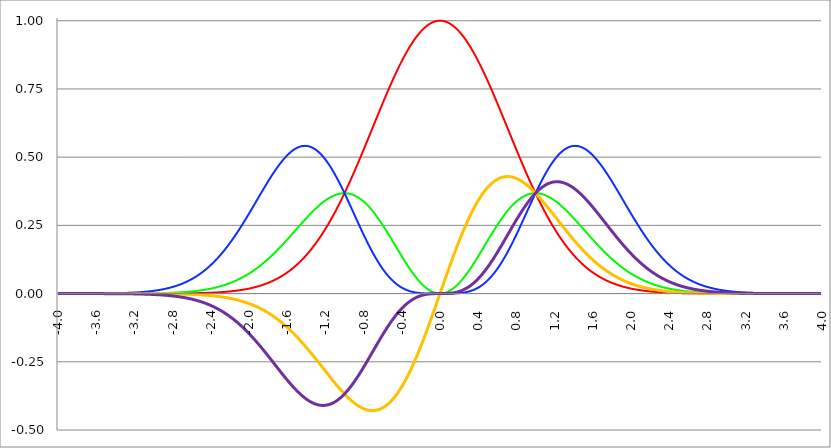
| Category | Series 1 | Series 0 | Series 2 | Series 3 | Series 4 |
|---|---|---|---|---|---|
| -4.0 | 0 | 0 | 0 | 0 | 0 |
| -3.996 | 0 | 0 | 0 | 0 | 0 |
| -3.992 | 0 | 0 | 0 | 0 | 0 |
| -3.988 | 0 | 0 | 0 | 0 | 0 |
| -3.984 | 0 | 0 | 0 | 0 | 0 |
| -3.98 | 0 | 0 | 0 | 0 | 0 |
| -3.976 | 0 | 0 | 0 | 0 | 0 |
| -3.972 | 0 | 0 | 0 | 0 | 0 |
| -3.968 | 0 | 0 | 0 | 0 | 0 |
| -3.964 | 0 | 0 | 0 | 0 | 0 |
| -3.96 | 0 | 0 | 0 | 0 | 0 |
| -3.956 | 0 | 0 | 0 | 0 | 0 |
| -3.952 | 0 | 0 | 0 | 0 | 0 |
| -3.948 | 0 | 0 | 0 | 0 | 0 |
| -3.944 | 0 | 0 | 0 | 0 | 0 |
| -3.94 | 0 | 0 | 0 | 0 | 0 |
| -3.936 | 0 | 0 | 0 | 0 | 0 |
| -3.932 | 0 | 0 | 0 | 0 | 0 |
| -3.928 | 0 | 0 | 0 | 0 | 0 |
| -3.924 | 0 | 0 | 0 | 0 | 0 |
| -3.92 | 0 | 0 | 0 | 0 | 0 |
| -3.916 | 0 | 0 | 0 | 0 | 0 |
| -3.912 | 0 | 0 | 0 | 0 | 0 |
| -3.908 | 0 | 0 | 0 | 0 | 0 |
| -3.904 | 0 | 0 | 0 | 0 | 0 |
| -3.9 | 0 | 0 | 0 | 0 | 0 |
| -3.896 | 0 | 0 | 0 | 0 | 0 |
| -3.892 | 0 | 0 | 0 | 0 | 0 |
| -3.888 | 0 | 0 | 0 | 0 | 0 |
| -3.884 | 0 | 0 | 0 | 0 | 0 |
| -3.88 | 0 | 0 | 0 | 0 | 0 |
| -3.876 | 0 | 0 | 0 | 0 | 0 |
| -3.872 | 0 | 0 | 0 | 0 | 0 |
| -3.868 | 0 | 0 | 0 | 0 | 0 |
| -3.864 | 0 | 0 | 0 | 0 | 0 |
| -3.86 | 0 | 0 | 0 | 0 | 0 |
| -3.856 | 0 | 0 | 0 | 0 | 0 |
| -3.852 | 0 | 0 | 0 | 0 | 0 |
| -3.848 | 0 | 0 | 0 | 0 | 0 |
| -3.844 | 0 | 0 | 0 | 0 | 0 |
| -3.84 | 0 | 0 | 0 | 0 | 0 |
| -3.836 | 0 | 0 | 0 | 0 | 0 |
| -3.832 | 0 | 0 | 0 | 0 | 0 |
| -3.828 | 0 | 0 | 0 | 0 | 0 |
| -3.824 | 0 | 0 | 0 | 0 | 0 |
| -3.82 | 0 | 0 | 0 | 0 | 0 |
| -3.816 | 0 | 0 | 0 | 0 | 0 |
| -3.812 | 0 | 0 | 0 | 0 | 0 |
| -3.808 | 0 | 0 | 0 | 0 | 0 |
| -3.804 | 0 | 0 | 0 | 0 | 0 |
| -3.8 | 0 | 0 | 0 | 0 | 0 |
| -3.796 | 0 | 0 | 0 | 0 | 0 |
| -3.792 | 0 | 0 | 0 | 0 | 0 |
| -3.788 | 0 | 0 | 0 | 0 | 0 |
| -3.784 | 0 | 0 | 0 | 0 | 0 |
| -3.78 | 0 | 0 | 0 | 0 | 0 |
| -3.776 | 0 | 0 | 0 | 0 | 0 |
| -3.772 | 0 | 0 | 0 | 0 | 0 |
| -3.768 | 0 | 0 | 0 | 0 | 0 |
| -3.764 | 0 | 0 | 0 | 0 | 0 |
| -3.76 | 0 | 0 | 0 | 0 | 0 |
| -3.756 | 0 | 0 | 0 | 0 | 0 |
| -3.752 | 0 | 0 | 0 | 0 | 0 |
| -3.748 | 0 | 0 | 0 | 0 | 0 |
| -3.744 | 0 | 0 | 0 | 0 | 0 |
| -3.74 | 0 | 0 | 0 | 0 | 0 |
| -3.736 | 0 | 0 | 0 | 0 | 0 |
| -3.732 | 0 | 0 | 0 | 0 | 0 |
| -3.728 | 0 | 0 | 0 | 0 | 0 |
| -3.724 | 0 | 0 | 0 | 0 | 0 |
| -3.72 | 0 | 0 | 0 | 0 | 0 |
| -3.716 | 0 | 0 | 0 | 0 | 0 |
| -3.712 | 0 | 0 | 0 | 0 | 0 |
| -3.708 | 0 | 0 | 0 | 0 | 0 |
| -3.704 | 0 | 0 | 0 | 0 | 0 |
| -3.7 | 0 | 0 | 0 | 0 | 0 |
| -3.696 | 0 | 0 | 0 | 0 | 0 |
| -3.692 | 0 | 0 | 0 | 0 | 0 |
| -3.688 | 0 | 0 | 0 | 0 | 0 |
| -3.684 | 0 | 0 | 0 | 0 | 0 |
| -3.68 | 0 | 0 | 0 | 0 | 0 |
| -3.676 | 0 | 0 | 0 | 0 | 0 |
| -3.672 | 0 | 0 | 0 | 0 | 0 |
| -3.668 | 0 | 0 | 0 | 0 | 0 |
| -3.664 | 0 | 0 | 0 | 0 | 0 |
| -3.66 | 0 | 0 | 0 | 0 | 0 |
| -3.656 | 0 | 0 | 0 | 0 | 0 |
| -3.652 | 0 | 0 | 0 | 0 | 0 |
| -3.648 | 0 | 0 | 0 | 0 | 0 |
| -3.644 | 0 | 0 | 0 | 0 | 0 |
| -3.64 | 0 | 0 | 0 | 0 | 0 |
| -3.636 | 0 | 0 | 0 | 0 | 0 |
| -3.632 | 0 | 0 | 0 | 0 | 0 |
| -3.628 | 0 | 0 | 0 | 0 | 0 |
| -3.624 | 0 | 0 | 0 | 0 | 0 |
| -3.62 | 0 | 0 | 0 | 0 | 0 |
| -3.616 | 0 | 0 | 0 | 0 | 0 |
| -3.612 | 0 | 0 | 0 | 0 | 0 |
| -3.608 | 0 | 0 | 0 | 0 | 0 |
| -3.604 | 0 | 0 | 0 | 0 | 0 |
| -3.6 | 0 | 0 | 0 | 0 | 0 |
| -3.596 | 0 | 0 | 0 | 0 | 0 |
| -3.592 | 0 | 0 | 0 | 0 | 0 |
| -3.588 | 0 | 0 | 0 | 0 | 0 |
| -3.584 | 0 | 0 | 0 | 0 | 0 |
| -3.58 | 0 | 0 | 0 | 0 | 0 |
| -3.576 | 0 | 0 | 0 | 0 | 0 |
| -3.572 | 0 | 0 | 0 | 0 | 0 |
| -3.568 | 0 | 0 | 0 | 0 | 0 |
| -3.564 | 0 | 0 | 0 | 0 | 0 |
| -3.56 | 0 | 0 | 0.001 | 0 | 0 |
| -3.556 | 0 | 0 | 0.001 | 0 | 0 |
| -3.552 | 0 | 0 | 0.001 | 0 | 0 |
| -3.548 | 0 | 0 | 0.001 | 0 | 0 |
| -3.544 | 0 | 0 | 0.001 | 0 | 0 |
| -3.54 | 0 | 0 | 0.001 | 0 | 0 |
| -3.536 | 0 | 0 | 0.001 | 0 | 0 |
| -3.532 | 0 | 0 | 0.001 | 0 | 0 |
| -3.528 | 0 | 0 | 0.001 | 0 | 0 |
| -3.524 | 0 | 0 | 0.001 | 0 | 0 |
| -3.52 | 0 | 0 | 0.001 | 0 | 0 |
| -3.516 | 0 | 0 | 0.001 | 0 | 0 |
| -3.512 | 0 | 0 | 0.001 | 0 | 0 |
| -3.508 | 0 | 0 | 0.001 | 0 | 0 |
| -3.504 | 0 | 0 | 0.001 | 0 | 0 |
| -3.5 | 0 | 0 | 0.001 | 0 | 0 |
| -3.496 | 0 | 0 | 0.001 | 0 | 0 |
| -3.492 | 0 | 0 | 0.001 | 0 | 0 |
| -3.488 | 0 | 0 | 0.001 | 0 | 0 |
| -3.484 | 0 | 0 | 0.001 | 0 | 0 |
| -3.48 | 0 | 0 | 0.001 | 0 | 0 |
| -3.476 | 0 | 0 | 0.001 | 0 | 0 |
| -3.472 | 0 | 0 | 0.001 | 0 | 0 |
| -3.467999999999999 | 0 | 0 | 0.001 | 0 | 0 |
| -3.463999999999999 | 0 | 0 | 0.001 | 0 | 0 |
| -3.459999999999999 | 0 | 0 | 0.001 | 0 | 0 |
| -3.455999999999999 | 0 | 0 | 0.001 | 0 | 0 |
| -3.451999999999999 | 0 | 0 | 0.001 | 0 | 0 |
| -3.447999999999999 | 0 | 0 | 0.001 | 0 | 0 |
| -3.443999999999999 | 0 | 0 | 0.001 | 0 | 0 |
| -3.439999999999999 | 0 | 0 | 0.001 | 0 | 0 |
| -3.435999999999999 | 0 | 0 | 0.001 | 0 | 0 |
| -3.431999999999999 | 0 | 0 | 0.001 | 0 | 0 |
| -3.427999999999999 | 0 | 0 | 0.001 | 0 | 0 |
| -3.423999999999999 | 0 | 0 | 0.001 | 0 | 0 |
| -3.419999999999999 | 0 | 0 | 0.001 | 0 | 0 |
| -3.415999999999999 | 0 | 0 | 0.001 | 0 | 0 |
| -3.411999999999999 | 0 | 0 | 0.001 | 0 | 0 |
| -3.407999999999999 | 0 | 0 | 0.001 | 0 | 0 |
| -3.403999999999999 | 0 | 0 | 0.001 | 0 | 0 |
| -3.399999999999999 | 0 | 0 | 0.001 | 0 | 0 |
| -3.395999999999999 | 0 | 0 | 0.001 | 0 | 0 |
| -3.391999999999999 | 0 | 0 | 0.001 | 0 | 0 |
| -3.387999999999999 | 0 | 0 | 0.001 | 0 | 0 |
| -3.383999999999999 | 0 | 0 | 0.001 | 0 | 0 |
| -3.379999999999999 | 0 | 0 | 0.001 | 0 | 0 |
| -3.375999999999999 | 0 | 0 | 0.001 | 0 | 0 |
| -3.371999999999999 | 0 | 0 | 0.001 | 0 | 0 |
| -3.367999999999999 | 0 | 0 | 0.002 | 0 | 0 |
| -3.363999999999999 | 0 | 0 | 0.002 | 0 | 0 |
| -3.359999999999999 | 0 | 0 | 0.002 | 0 | 0 |
| -3.355999999999999 | 0 | 0 | 0.002 | 0 | 0 |
| -3.351999999999999 | 0 | 0 | 0.002 | 0 | 0 |
| -3.347999999999999 | 0 | 0 | 0.002 | 0 | -0.001 |
| -3.343999999999999 | 0 | 0 | 0.002 | 0 | -0.001 |
| -3.339999999999999 | 0 | 0 | 0.002 | 0 | -0.001 |
| -3.335999999999999 | 0 | 0 | 0.002 | 0 | -0.001 |
| -3.331999999999999 | 0 | 0 | 0.002 | 0 | -0.001 |
| -3.327999999999999 | 0 | 0 | 0.002 | 0 | -0.001 |
| -3.323999999999999 | 0 | 0 | 0.002 | 0 | -0.001 |
| -3.319999999999999 | 0 | 0 | 0.002 | 0 | -0.001 |
| -3.315999999999999 | 0 | 0 | 0.002 | 0 | -0.001 |
| -3.311999999999999 | 0 | 0 | 0.002 | 0 | -0.001 |
| -3.307999999999999 | 0 | 0 | 0.002 | 0 | -0.001 |
| -3.303999999999999 | 0 | 0 | 0.002 | 0 | -0.001 |
| -3.299999999999999 | 0 | 0 | 0.002 | 0 | -0.001 |
| -3.295999999999999 | 0 | 0 | 0.002 | 0 | -0.001 |
| -3.291999999999999 | 0 | 0 | 0.002 | 0 | -0.001 |
| -3.288 | 0 | 0 | 0.002 | 0 | -0.001 |
| -3.284 | 0 | 0 | 0.002 | 0 | -0.001 |
| -3.279999999999999 | 0 | 0 | 0.002 | 0 | -0.001 |
| -3.275999999999999 | 0 | 0 | 0.003 | 0 | -0.001 |
| -3.271999999999999 | 0 | 0 | 0.003 | 0 | -0.001 |
| -3.268 | 0 | 0 | 0.003 | 0 | -0.001 |
| -3.264 | 0 | 0 | 0.003 | 0 | -0.001 |
| -3.259999999999999 | 0 | 0 | 0.003 | 0 | -0.001 |
| -3.255999999999999 | 0 | 0 | 0.003 | 0 | -0.001 |
| -3.251999999999999 | 0 | 0 | 0.003 | 0 | -0.001 |
| -3.248 | 0 | 0 | 0.003 | 0 | -0.001 |
| -3.244 | 0 | 0 | 0.003 | 0 | -0.001 |
| -3.239999999999999 | 0 | 0 | 0.003 | 0 | -0.001 |
| -3.235999999999999 | 0 | 0 | 0.003 | 0 | -0.001 |
| -3.231999999999999 | 0 | 0 | 0.003 | 0 | -0.001 |
| -3.228 | 0 | 0 | 0.003 | 0 | -0.001 |
| -3.224 | 0 | 0 | 0.003 | 0 | -0.001 |
| -3.219999999999999 | 0 | 0 | 0.003 | 0 | -0.001 |
| -3.215999999999999 | 0 | 0 | 0.003 | 0 | -0.001 |
| -3.211999999999999 | 0 | 0 | 0.004 | 0 | -0.001 |
| -3.208 | 0 | 0 | 0.004 | 0 | -0.001 |
| -3.204 | 0 | 0 | 0.004 | 0 | -0.001 |
| -3.199999999999999 | 0 | 0 | 0.004 | 0 | -0.001 |
| -3.195999999999999 | 0 | 0 | 0.004 | 0 | -0.001 |
| -3.191999999999999 | 0 | 0 | 0.004 | 0 | -0.001 |
| -3.188 | 0 | 0 | 0.004 | 0 | -0.001 |
| -3.184 | 0 | 0 | 0.004 | 0 | -0.001 |
| -3.179999999999999 | 0 | 0 | 0.004 | 0 | -0.001 |
| -3.175999999999999 | 0 | 0 | 0.004 | 0 | -0.001 |
| -3.171999999999999 | 0 | 0 | 0.004 | 0 | -0.001 |
| -3.168 | 0 | 0 | 0.004 | 0 | -0.001 |
| -3.164 | 0 | 0 | 0.005 | 0 | -0.001 |
| -3.159999999999999 | 0 | 0 | 0.005 | 0 | -0.001 |
| -3.155999999999999 | 0 | 0 | 0.005 | 0 | -0.001 |
| -3.151999999999999 | 0 | 0 | 0.005 | 0 | -0.002 |
| -3.148 | 0 | 0 | 0.005 | 0 | -0.002 |
| -3.144 | 0 | 0.001 | 0.005 | 0 | -0.002 |
| -3.139999999999999 | 0 | 0.001 | 0.005 | 0 | -0.002 |
| -3.135999999999999 | 0 | 0.001 | 0.005 | 0 | -0.002 |
| -3.131999999999999 | 0 | 0.001 | 0.005 | 0 | -0.002 |
| -3.128 | 0 | 0.001 | 0.005 | 0 | -0.002 |
| -3.124 | 0 | 0.001 | 0.006 | 0 | -0.002 |
| -3.119999999999999 | 0 | 0.001 | 0.006 | 0 | -0.002 |
| -3.115999999999999 | 0 | 0.001 | 0.006 | 0 | -0.002 |
| -3.111999999999999 | 0 | 0.001 | 0.006 | 0 | -0.002 |
| -3.108 | 0 | 0.001 | 0.006 | 0 | -0.002 |
| -3.104 | 0 | 0.001 | 0.006 | 0 | -0.002 |
| -3.099999999999999 | 0 | 0.001 | 0.006 | 0 | -0.002 |
| -3.095999999999999 | 0 | 0.001 | 0.006 | 0 | -0.002 |
| -3.091999999999999 | 0 | 0.001 | 0.006 | 0 | -0.002 |
| -3.088 | 0 | 0.001 | 0.007 | 0 | -0.002 |
| -3.084 | 0 | 0.001 | 0.007 | 0 | -0.002 |
| -3.079999999999999 | 0 | 0.001 | 0.007 | 0 | -0.002 |
| -3.075999999999999 | 0 | 0.001 | 0.007 | 0 | -0.002 |
| -3.071999999999999 | 0 | 0.001 | 0.007 | 0 | -0.002 |
| -3.068 | 0 | 0.001 | 0.007 | 0 | -0.002 |
| -3.064 | 0 | 0.001 | 0.007 | 0 | -0.002 |
| -3.059999999999999 | 0 | 0.001 | 0.008 | 0 | -0.002 |
| -3.055999999999999 | 0 | 0.001 | 0.008 | 0 | -0.003 |
| -3.051999999999999 | 0 | 0.001 | 0.008 | 0 | -0.003 |
| -3.048 | 0 | 0.001 | 0.008 | 0 | -0.003 |
| -3.044 | 0 | 0.001 | 0.008 | 0 | -0.003 |
| -3.039999999999999 | 0 | 0.001 | 0.008 | 0 | -0.003 |
| -3.035999999999999 | 0 | 0.001 | 0.008 | 0 | -0.003 |
| -3.031999999999999 | 0 | 0.001 | 0.009 | 0 | -0.003 |
| -3.028 | 0 | 0.001 | 0.009 | 0 | -0.003 |
| -3.024 | 0 | 0.001 | 0.009 | 0 | -0.003 |
| -3.019999999999999 | 0 | 0.001 | 0.009 | 0 | -0.003 |
| -3.015999999999999 | 0 | 0.001 | 0.009 | 0 | -0.003 |
| -3.011999999999999 | 0 | 0.001 | 0.009 | 0 | -0.003 |
| -3.008 | 0 | 0.001 | 0.01 | 0 | -0.003 |
| -3.004 | 0 | 0.001 | 0.01 | 0 | -0.003 |
| -2.999999999999999 | 0 | 0.001 | 0.01 | 0 | -0.003 |
| -2.995999999999999 | 0 | 0.001 | 0.01 | 0 | -0.003 |
| -2.991999999999999 | 0 | 0.001 | 0.01 | 0 | -0.003 |
| -2.988 | 0 | 0.001 | 0.011 | 0 | -0.004 |
| -2.984 | 0 | 0.001 | 0.011 | 0 | -0.004 |
| -2.979999999999999 | 0 | 0.001 | 0.011 | 0 | -0.004 |
| -2.975999999999999 | 0 | 0.001 | 0.011 | 0 | -0.004 |
| -2.971999999999999 | 0 | 0.001 | 0.011 | 0 | -0.004 |
| -2.968 | 0 | 0.001 | 0.012 | 0 | -0.004 |
| -2.964 | 0 | 0.001 | 0.012 | 0 | -0.004 |
| -2.959999999999999 | 0 | 0.001 | 0.012 | 0 | -0.004 |
| -2.955999999999999 | 0 | 0.001 | 0.012 | 0 | -0.004 |
| -2.951999999999999 | 0 | 0.001 | 0.012 | 0 | -0.004 |
| -2.948 | 0 | 0.001 | 0.013 | 0 | -0.004 |
| -2.944 | 0 | 0.001 | 0.013 | -0.001 | -0.004 |
| -2.939999999999999 | 0 | 0.002 | 0.013 | -0.001 | -0.004 |
| -2.935999999999999 | 0 | 0.002 | 0.013 | -0.001 | -0.005 |
| -2.931999999999999 | 0 | 0.002 | 0.014 | -0.001 | -0.005 |
| -2.928 | 0 | 0.002 | 0.014 | -0.001 | -0.005 |
| -2.924 | 0 | 0.002 | 0.014 | -0.001 | -0.005 |
| -2.919999999999999 | 0 | 0.002 | 0.014 | -0.001 | -0.005 |
| -2.915999999999999 | 0 | 0.002 | 0.015 | -0.001 | -0.005 |
| -2.911999999999999 | 0 | 0.002 | 0.015 | -0.001 | -0.005 |
| -2.908 | 0 | 0.002 | 0.015 | -0.001 | -0.005 |
| -2.904 | 0 | 0.002 | 0.015 | -0.001 | -0.005 |
| -2.899999999999999 | 0 | 0.002 | 0.016 | -0.001 | -0.005 |
| -2.895999999999999 | 0 | 0.002 | 0.016 | -0.001 | -0.006 |
| -2.891999999999999 | 0 | 0.002 | 0.016 | -0.001 | -0.006 |
| -2.887999999999999 | 0 | 0.002 | 0.017 | -0.001 | -0.006 |
| -2.883999999999999 | 0 | 0.002 | 0.017 | -0.001 | -0.006 |
| -2.879999999999999 | 0 | 0.002 | 0.017 | -0.001 | -0.006 |
| -2.875999999999999 | 0 | 0.002 | 0.017 | -0.001 | -0.006 |
| -2.871999999999999 | 0 | 0.002 | 0.018 | -0.001 | -0.006 |
| -2.867999999999999 | 0 | 0.002 | 0.018 | -0.001 | -0.006 |
| -2.863999999999999 | 0 | 0.002 | 0.018 | -0.001 | -0.006 |
| -2.859999999999999 | 0 | 0.002 | 0.019 | -0.001 | -0.007 |
| -2.855999999999999 | 0 | 0.002 | 0.019 | -0.001 | -0.007 |
| -2.851999999999999 | 0 | 0.002 | 0.019 | -0.001 | -0.007 |
| -2.847999999999999 | 0 | 0.002 | 0.02 | -0.001 | -0.007 |
| -2.843999999999999 | 0 | 0.002 | 0.02 | -0.001 | -0.007 |
| -2.839999999999999 | 0 | 0.003 | 0.02 | -0.001 | -0.007 |
| -2.835999999999999 | 0 | 0.003 | 0.021 | -0.001 | -0.007 |
| -2.831999999999999 | 0 | 0.003 | 0.021 | -0.001 | -0.007 |
| -2.827999999999999 | 0 | 0.003 | 0.022 | -0.001 | -0.008 |
| -2.823999999999999 | 0 | 0.003 | 0.022 | -0.001 | -0.008 |
| -2.819999999999999 | 0 | 0.003 | 0.022 | -0.001 | -0.008 |
| -2.815999999999999 | 0 | 0.003 | 0.023 | -0.001 | -0.008 |
| -2.811999999999999 | 0 | 0.003 | 0.023 | -0.001 | -0.008 |
| -2.807999999999999 | 0 | 0.003 | 0.023 | -0.001 | -0.008 |
| -2.803999999999999 | 0 | 0.003 | 0.024 | -0.001 | -0.008 |
| -2.799999999999999 | 0 | 0.003 | 0.024 | -0.001 | -0.009 |
| -2.795999999999999 | 0 | 0.003 | 0.025 | -0.001 | -0.009 |
| -2.791999999999999 | 0 | 0.003 | 0.025 | -0.001 | -0.009 |
| -2.787999999999999 | 0 | 0.003 | 0.025 | -0.001 | -0.009 |
| -2.783999999999999 | 0 | 0.003 | 0.026 | -0.001 | -0.009 |
| -2.779999999999999 | 0 | 0.003 | 0.026 | -0.001 | -0.009 |
| -2.775999999999999 | 0 | 0.003 | 0.027 | -0.001 | -0.01 |
| -2.771999999999999 | 0 | 0.004 | 0.027 | -0.001 | -0.01 |
| -2.767999999999999 | 0 | 0.004 | 0.028 | -0.001 | -0.01 |
| -2.763999999999999 | 0 | 0.004 | 0.028 | -0.001 | -0.01 |
| -2.759999999999999 | 0 | 0.004 | 0.029 | -0.001 | -0.01 |
| -2.755999999999999 | 0.001 | 0.004 | 0.029 | -0.001 | -0.011 |
| -2.751999999999999 | 0.001 | 0.004 | 0.029 | -0.001 | -0.011 |
| -2.747999999999999 | 0.001 | 0.004 | 0.03 | -0.001 | -0.011 |
| -2.743999999999999 | 0.001 | 0.004 | 0.03 | -0.001 | -0.011 |
| -2.739999999999999 | 0.001 | 0.004 | 0.031 | -0.002 | -0.011 |
| -2.735999999999999 | 0.001 | 0.004 | 0.031 | -0.002 | -0.011 |
| -2.731999999999999 | 0.001 | 0.004 | 0.032 | -0.002 | -0.012 |
| -2.727999999999999 | 0.001 | 0.004 | 0.032 | -0.002 | -0.012 |
| -2.723999999999999 | 0.001 | 0.004 | 0.033 | -0.002 | -0.012 |
| -2.719999999999999 | 0.001 | 0.005 | 0.034 | -0.002 | -0.012 |
| -2.715999999999999 | 0.001 | 0.005 | 0.034 | -0.002 | -0.013 |
| -2.711999999999999 | 0.001 | 0.005 | 0.035 | -0.002 | -0.013 |
| -2.707999999999999 | 0.001 | 0.005 | 0.035 | -0.002 | -0.013 |
| -2.703999999999999 | 0.001 | 0.005 | 0.036 | -0.002 | -0.013 |
| -2.699999999999999 | 0.001 | 0.005 | 0.036 | -0.002 | -0.013 |
| -2.695999999999999 | 0.001 | 0.005 | 0.037 | -0.002 | -0.014 |
| -2.691999999999999 | 0.001 | 0.005 | 0.037 | -0.002 | -0.014 |
| -2.687999999999999 | 0.001 | 0.005 | 0.038 | -0.002 | -0.014 |
| -2.683999999999999 | 0.001 | 0.005 | 0.039 | -0.002 | -0.014 |
| -2.679999999999999 | 0.001 | 0.005 | 0.039 | -0.002 | -0.015 |
| -2.675999999999999 | 0.001 | 0.006 | 0.04 | -0.002 | -0.015 |
| -2.671999999999999 | 0.001 | 0.006 | 0.04 | -0.002 | -0.015 |
| -2.667999999999999 | 0.001 | 0.006 | 0.041 | -0.002 | -0.015 |
| -2.663999999999999 | 0.001 | 0.006 | 0.042 | -0.002 | -0.016 |
| -2.659999999999999 | 0.001 | 0.006 | 0.042 | -0.002 | -0.016 |
| -2.655999999999999 | 0.001 | 0.006 | 0.043 | -0.002 | -0.016 |
| -2.651999999999999 | 0.001 | 0.006 | 0.044 | -0.002 | -0.016 |
| -2.647999999999999 | 0.001 | 0.006 | 0.044 | -0.002 | -0.017 |
| -2.643999999999999 | 0.001 | 0.006 | 0.045 | -0.002 | -0.017 |
| -2.639999999999999 | 0.001 | 0.007 | 0.046 | -0.002 | -0.017 |
| -2.635999999999999 | 0.001 | 0.007 | 0.046 | -0.003 | -0.018 |
| -2.631999999999999 | 0.001 | 0.007 | 0.047 | -0.003 | -0.018 |
| -2.627999999999999 | 0.001 | 0.007 | 0.048 | -0.003 | -0.018 |
| -2.623999999999999 | 0.001 | 0.007 | 0.048 | -0.003 | -0.018 |
| -2.619999999999999 | 0.001 | 0.007 | 0.049 | -0.003 | -0.019 |
| -2.615999999999999 | 0.001 | 0.007 | 0.05 | -0.003 | -0.019 |
| -2.611999999999999 | 0.001 | 0.007 | 0.051 | -0.003 | -0.019 |
| -2.607999999999999 | 0.001 | 0.008 | 0.051 | -0.003 | -0.02 |
| -2.603999999999999 | 0.001 | 0.008 | 0.052 | -0.003 | -0.02 |
| -2.599999999999999 | 0.001 | 0.008 | 0.053 | -0.003 | -0.02 |
| -2.595999999999999 | 0.001 | 0.008 | 0.054 | -0.003 | -0.021 |
| -2.591999999999999 | 0.001 | 0.008 | 0.055 | -0.003 | -0.021 |
| -2.587999999999999 | 0.001 | 0.008 | 0.055 | -0.003 | -0.021 |
| -2.583999999999999 | 0.001 | 0.008 | 0.056 | -0.003 | -0.022 |
| -2.579999999999999 | 0.001 | 0.009 | 0.057 | -0.003 | -0.022 |
| -2.575999999999999 | 0.001 | 0.009 | 0.058 | -0.003 | -0.022 |
| -2.571999999999999 | 0.001 | 0.009 | 0.059 | -0.003 | -0.023 |
| -2.567999999999999 | 0.001 | 0.009 | 0.059 | -0.004 | -0.023 |
| -2.563999999999999 | 0.001 | 0.009 | 0.06 | -0.004 | -0.024 |
| -2.559999999999999 | 0.001 | 0.009 | 0.061 | -0.004 | -0.024 |
| -2.555999999999999 | 0.001 | 0.01 | 0.062 | -0.004 | -0.024 |
| -2.551999999999999 | 0.001 | 0.01 | 0.063 | -0.004 | -0.025 |
| -2.547999999999999 | 0.002 | 0.01 | 0.064 | -0.004 | -0.025 |
| -2.543999999999999 | 0.002 | 0.01 | 0.065 | -0.004 | -0.025 |
| -2.539999999999999 | 0.002 | 0.01 | 0.066 | -0.004 | -0.026 |
| -2.535999999999999 | 0.002 | 0.01 | 0.067 | -0.004 | -0.026 |
| -2.531999999999999 | 0.002 | 0.011 | 0.068 | -0.004 | -0.027 |
| -2.527999999999999 | 0.002 | 0.011 | 0.068 | -0.004 | -0.027 |
| -2.523999999999999 | 0.002 | 0.011 | 0.069 | -0.004 | -0.028 |
| -2.519999999999999 | 0.002 | 0.011 | 0.07 | -0.004 | -0.028 |
| -2.515999999999999 | 0.002 | 0.011 | 0.071 | -0.004 | -0.028 |
| -2.511999999999999 | 0.002 | 0.011 | 0.072 | -0.005 | -0.029 |
| -2.507999999999999 | 0.002 | 0.012 | 0.073 | -0.005 | -0.029 |
| -2.503999999999999 | 0.002 | 0.012 | 0.074 | -0.005 | -0.03 |
| -2.499999999999999 | 0.002 | 0.012 | 0.075 | -0.005 | -0.03 |
| -2.495999999999999 | 0.002 | 0.012 | 0.076 | -0.005 | -0.031 |
| -2.491999999999999 | 0.002 | 0.012 | 0.077 | -0.005 | -0.031 |
| -2.487999999999999 | 0.002 | 0.013 | 0.079 | -0.005 | -0.032 |
| -2.483999999999999 | 0.002 | 0.013 | 0.08 | -0.005 | -0.032 |
| -2.479999999999999 | 0.002 | 0.013 | 0.081 | -0.005 | -0.033 |
| -2.475999999999999 | 0.002 | 0.013 | 0.082 | -0.005 | -0.033 |
| -2.471999999999999 | 0.002 | 0.014 | 0.083 | -0.005 | -0.034 |
| -2.467999999999999 | 0.002 | 0.014 | 0.084 | -0.006 | -0.034 |
| -2.463999999999999 | 0.002 | 0.014 | 0.085 | -0.006 | -0.035 |
| -2.459999999999999 | 0.002 | 0.014 | 0.086 | -0.006 | -0.035 |
| -2.455999999999999 | 0.002 | 0.014 | 0.087 | -0.006 | -0.036 |
| -2.451999999999999 | 0.002 | 0.015 | 0.089 | -0.006 | -0.036 |
| -2.447999999999999 | 0.002 | 0.015 | 0.09 | -0.006 | -0.037 |
| -2.443999999999999 | 0.003 | 0.015 | 0.091 | -0.006 | -0.037 |
| -2.439999999999999 | 0.003 | 0.015 | 0.092 | -0.006 | -0.038 |
| -2.435999999999999 | 0.003 | 0.016 | 0.093 | -0.006 | -0.038 |
| -2.431999999999999 | 0.003 | 0.016 | 0.094 | -0.007 | -0.039 |
| -2.427999999999999 | 0.003 | 0.016 | 0.096 | -0.007 | -0.039 |
| -2.423999999999999 | 0.003 | 0.016 | 0.097 | -0.007 | -0.04 |
| -2.419999999999999 | 0.003 | 0.017 | 0.098 | -0.007 | -0.041 |
| -2.415999999999999 | 0.003 | 0.017 | 0.099 | -0.007 | -0.041 |
| -2.411999999999999 | 0.003 | 0.017 | 0.101 | -0.007 | -0.042 |
| -2.407999999999999 | 0.003 | 0.018 | 0.102 | -0.007 | -0.042 |
| -2.403999999999999 | 0.003 | 0.018 | 0.103 | -0.007 | -0.043 |
| -2.399999999999999 | 0.003 | 0.018 | 0.105 | -0.008 | -0.044 |
| -2.395999999999999 | 0.003 | 0.018 | 0.106 | -0.008 | -0.044 |
| -2.391999999999999 | 0.003 | 0.019 | 0.107 | -0.008 | -0.045 |
| -2.387999999999999 | 0.003 | 0.019 | 0.109 | -0.008 | -0.045 |
| -2.383999999999999 | 0.003 | 0.019 | 0.11 | -0.008 | -0.046 |
| -2.379999999999999 | 0.003 | 0.02 | 0.111 | -0.008 | -0.047 |
| -2.375999999999999 | 0.004 | 0.02 | 0.113 | -0.008 | -0.047 |
| -2.371999999999999 | 0.004 | 0.02 | 0.114 | -0.009 | -0.048 |
| -2.367999999999998 | 0.004 | 0.021 | 0.115 | -0.009 | -0.049 |
| -2.363999999999998 | 0.004 | 0.021 | 0.117 | -0.009 | -0.049 |
| -2.359999999999998 | 0.004 | 0.021 | 0.118 | -0.009 | -0.05 |
| -2.355999999999998 | 0.004 | 0.022 | 0.12 | -0.009 | -0.051 |
| -2.351999999999998 | 0.004 | 0.022 | 0.121 | -0.009 | -0.052 |
| -2.347999999999998 | 0.004 | 0.022 | 0.123 | -0.009 | -0.052 |
| -2.343999999999998 | 0.004 | 0.023 | 0.124 | -0.01 | -0.053 |
| -2.339999999999998 | 0.004 | 0.023 | 0.126 | -0.01 | -0.054 |
| -2.335999999999998 | 0.004 | 0.023 | 0.127 | -0.01 | -0.054 |
| -2.331999999999998 | 0.004 | 0.024 | 0.129 | -0.01 | -0.055 |
| -2.327999999999998 | 0.004 | 0.024 | 0.13 | -0.01 | -0.056 |
| -2.323999999999998 | 0.005 | 0.024 | 0.132 | -0.01 | -0.057 |
| -2.319999999999998 | 0.005 | 0.025 | 0.133 | -0.011 | -0.057 |
| -2.315999999999998 | 0.005 | 0.025 | 0.135 | -0.011 | -0.058 |
| -2.311999999999998 | 0.005 | 0.025 | 0.136 | -0.011 | -0.059 |
| -2.307999999999998 | 0.005 | 0.026 | 0.138 | -0.011 | -0.06 |
| -2.303999999999998 | 0.005 | 0.026 | 0.139 | -0.011 | -0.061 |
| -2.299999999999998 | 0.005 | 0.027 | 0.141 | -0.012 | -0.061 |
| -2.295999999999998 | 0.005 | 0.027 | 0.143 | -0.012 | -0.062 |
| -2.291999999999998 | 0.005 | 0.027 | 0.144 | -0.012 | -0.063 |
| -2.287999999999998 | 0.005 | 0.028 | 0.146 | -0.012 | -0.064 |
| -2.283999999999998 | 0.005 | 0.028 | 0.148 | -0.012 | -0.065 |
| -2.279999999999998 | 0.006 | 0.029 | 0.149 | -0.013 | -0.065 |
| -2.275999999999998 | 0.006 | 0.029 | 0.151 | -0.013 | -0.066 |
| -2.271999999999998 | 0.006 | 0.03 | 0.153 | -0.013 | -0.067 |
| -2.267999999999998 | 0.006 | 0.03 | 0.154 | -0.013 | -0.068 |
| -2.263999999999998 | 0.006 | 0.03 | 0.156 | -0.013 | -0.069 |
| -2.259999999999998 | 0.006 | 0.031 | 0.158 | -0.014 | -0.07 |
| -2.255999999999998 | 0.006 | 0.031 | 0.16 | -0.014 | -0.071 |
| -2.251999999999998 | 0.006 | 0.032 | 0.161 | -0.014 | -0.072 |
| -2.247999999999998 | 0.006 | 0.032 | 0.163 | -0.014 | -0.073 |
| -2.243999999999998 | 0.007 | 0.033 | 0.165 | -0.015 | -0.073 |
| -2.239999999999998 | 0.007 | 0.033 | 0.167 | -0.015 | -0.074 |
| -2.235999999999998 | 0.007 | 0.034 | 0.168 | -0.015 | -0.075 |
| -2.231999999999998 | 0.007 | 0.034 | 0.17 | -0.015 | -0.076 |
| -2.227999999999998 | 0.007 | 0.035 | 0.172 | -0.016 | -0.077 |
| -2.223999999999998 | 0.007 | 0.035 | 0.174 | -0.016 | -0.078 |
| -2.219999999999998 | 0.007 | 0.036 | 0.176 | -0.016 | -0.079 |
| -2.215999999999998 | 0.007 | 0.036 | 0.178 | -0.016 | -0.08 |
| -2.211999999999998 | 0.007 | 0.037 | 0.18 | -0.017 | -0.081 |
| -2.207999999999998 | 0.008 | 0.037 | 0.181 | -0.017 | -0.082 |
| -2.203999999999998 | 0.008 | 0.038 | 0.183 | -0.017 | -0.083 |
| -2.199999999999998 | 0.008 | 0.038 | 0.185 | -0.017 | -0.084 |
| -2.195999999999998 | 0.008 | 0.039 | 0.187 | -0.018 | -0.085 |
| -2.191999999999998 | 0.008 | 0.039 | 0.189 | -0.018 | -0.086 |
| -2.187999999999998 | 0.008 | 0.04 | 0.191 | -0.018 | -0.087 |
| -2.183999999999998 | 0.008 | 0.04 | 0.193 | -0.019 | -0.088 |
| -2.179999999999998 | 0.009 | 0.041 | 0.195 | -0.019 | -0.089 |
| -2.175999999999998 | 0.009 | 0.042 | 0.197 | -0.019 | -0.09 |
| -2.171999999999998 | 0.009 | 0.042 | 0.199 | -0.019 | -0.092 |
| -2.167999999999998 | 0.009 | 0.043 | 0.201 | -0.02 | -0.093 |
| -2.163999999999998 | 0.009 | 0.043 | 0.203 | -0.02 | -0.094 |
| -2.159999999999998 | 0.009 | 0.044 | 0.205 | -0.02 | -0.095 |
| -2.155999999999998 | 0.01 | 0.045 | 0.207 | -0.021 | -0.096 |
| -2.151999999999998 | 0.01 | 0.045 | 0.209 | -0.021 | -0.097 |
| -2.147999999999998 | 0.01 | 0.046 | 0.211 | -0.021 | -0.098 |
| -2.143999999999998 | 0.01 | 0.046 | 0.213 | -0.022 | -0.099 |
| -2.139999999999998 | 0.01 | 0.047 | 0.215 | -0.022 | -0.101 |
| -2.135999999999998 | 0.01 | 0.048 | 0.217 | -0.022 | -0.102 |
| -2.131999999999998 | 0.011 | 0.048 | 0.219 | -0.023 | -0.103 |
| -2.127999999999998 | 0.011 | 0.049 | 0.221 | -0.023 | -0.104 |
| -2.123999999999998 | 0.011 | 0.05 | 0.224 | -0.023 | -0.105 |
| -2.119999999999998 | 0.011 | 0.05 | 0.226 | -0.024 | -0.106 |
| -2.115999999999998 | 0.011 | 0.051 | 0.228 | -0.024 | -0.108 |
| -2.111999999999998 | 0.012 | 0.052 | 0.23 | -0.024 | -0.109 |
| -2.107999999999998 | 0.012 | 0.052 | 0.232 | -0.025 | -0.11 |
| -2.103999999999998 | 0.012 | 0.053 | 0.234 | -0.025 | -0.111 |
| -2.099999999999998 | 0.012 | 0.054 | 0.236 | -0.026 | -0.113 |
| -2.095999999999998 | 0.012 | 0.054 | 0.239 | -0.026 | -0.114 |
| -2.091999999999998 | 0.013 | 0.055 | 0.241 | -0.026 | -0.115 |
| -2.087999999999998 | 0.013 | 0.056 | 0.243 | -0.027 | -0.116 |
| -2.083999999999998 | 0.013 | 0.056 | 0.245 | -0.027 | -0.118 |
| -2.079999999999998 | 0.013 | 0.057 | 0.247 | -0.027 | -0.119 |
| -2.075999999999998 | 0.013 | 0.058 | 0.25 | -0.028 | -0.12 |
| -2.071999999999998 | 0.014 | 0.059 | 0.252 | -0.028 | -0.122 |
| -2.067999999999998 | 0.014 | 0.059 | 0.254 | -0.029 | -0.123 |
| -2.063999999999998 | 0.014 | 0.06 | 0.256 | -0.029 | -0.124 |
| -2.059999999999998 | 0.014 | 0.061 | 0.259 | -0.03 | -0.125 |
| -2.055999999999998 | 0.015 | 0.062 | 0.261 | -0.03 | -0.127 |
| -2.051999999999998 | 0.015 | 0.062 | 0.263 | -0.03 | -0.128 |
| -2.047999999999998 | 0.015 | 0.063 | 0.265 | -0.031 | -0.13 |
| -2.043999999999998 | 0.015 | 0.064 | 0.268 | -0.031 | -0.131 |
| -2.039999999999998 | 0.016 | 0.065 | 0.27 | -0.032 | -0.132 |
| -2.035999999999998 | 0.016 | 0.066 | 0.272 | -0.032 | -0.134 |
| -2.031999999999998 | 0.016 | 0.066 | 0.274 | -0.033 | -0.135 |
| -2.027999999999998 | 0.016 | 0.067 | 0.277 | -0.033 | -0.136 |
| -2.023999999999998 | 0.017 | 0.068 | 0.279 | -0.034 | -0.138 |
| -2.019999999999998 | 0.017 | 0.069 | 0.281 | -0.034 | -0.139 |
| -2.015999999999998 | 0.017 | 0.07 | 0.284 | -0.035 | -0.141 |
| -2.011999999999998 | 0.017 | 0.071 | 0.286 | -0.035 | -0.142 |
| -2.007999999999998 | 0.018 | 0.072 | 0.288 | -0.036 | -0.144 |
| -2.003999999999998 | 0.018 | 0.072 | 0.291 | -0.036 | -0.145 |
| -1.999999999999998 | 0.018 | 0.073 | 0.293 | -0.037 | -0.147 |
| -1.995999999999998 | 0.019 | 0.074 | 0.295 | -0.037 | -0.148 |
| -1.991999999999998 | 0.019 | 0.075 | 0.298 | -0.038 | -0.149 |
| -1.987999999999998 | 0.019 | 0.076 | 0.3 | -0.038 | -0.151 |
| -1.983999999999998 | 0.02 | 0.077 | 0.302 | -0.039 | -0.152 |
| -1.979999999999998 | 0.02 | 0.078 | 0.305 | -0.039 | -0.154 |
| -1.975999999999998 | 0.02 | 0.079 | 0.307 | -0.04 | -0.155 |
| -1.971999999999998 | 0.02 | 0.08 | 0.31 | -0.04 | -0.157 |
| -1.967999999999998 | 0.021 | 0.081 | 0.312 | -0.041 | -0.159 |
| -1.963999999999998 | 0.021 | 0.081 | 0.314 | -0.041 | -0.16 |
| -1.959999999999998 | 0.021 | 0.082 | 0.317 | -0.042 | -0.162 |
| -1.955999999999998 | 0.022 | 0.083 | 0.319 | -0.043 | -0.163 |
| -1.951999999999998 | 0.022 | 0.084 | 0.321 | -0.043 | -0.165 |
| -1.947999999999998 | 0.022 | 0.085 | 0.324 | -0.044 | -0.166 |
| -1.943999999999998 | 0.023 | 0.086 | 0.326 | -0.044 | -0.168 |
| -1.939999999999998 | 0.023 | 0.087 | 0.329 | -0.045 | -0.169 |
| -1.935999999999998 | 0.024 | 0.088 | 0.331 | -0.046 | -0.171 |
| -1.931999999999998 | 0.024 | 0.089 | 0.333 | -0.046 | -0.173 |
| -1.927999999999998 | 0.024 | 0.09 | 0.336 | -0.047 | -0.174 |
| -1.923999999999998 | 0.025 | 0.091 | 0.338 | -0.047 | -0.176 |
| -1.919999999999998 | 0.025 | 0.092 | 0.341 | -0.048 | -0.177 |
| -1.915999999999998 | 0.025 | 0.093 | 0.343 | -0.049 | -0.179 |
| -1.911999999999998 | 0.026 | 0.094 | 0.345 | -0.049 | -0.181 |
| -1.907999999999998 | 0.026 | 0.096 | 0.348 | -0.05 | -0.182 |
| -1.903999999999998 | 0.027 | 0.097 | 0.35 | -0.051 | -0.184 |
| -1.899999999999998 | 0.027 | 0.098 | 0.353 | -0.051 | -0.186 |
| -1.895999999999998 | 0.027 | 0.099 | 0.355 | -0.052 | -0.187 |
| -1.891999999999998 | 0.028 | 0.1 | 0.357 | -0.053 | -0.189 |
| -1.887999999999998 | 0.028 | 0.101 | 0.36 | -0.053 | -0.191 |
| -1.883999999999998 | 0.029 | 0.102 | 0.362 | -0.054 | -0.192 |
| -1.879999999999998 | 0.029 | 0.103 | 0.364 | -0.055 | -0.194 |
| -1.875999999999998 | 0.03 | 0.104 | 0.367 | -0.056 | -0.196 |
| -1.871999999999998 | 0.03 | 0.105 | 0.369 | -0.056 | -0.197 |
| -1.867999999999998 | 0.031 | 0.106 | 0.372 | -0.057 | -0.199 |
| -1.863999999999998 | 0.031 | 0.108 | 0.374 | -0.058 | -0.201 |
| -1.859999999999998 | 0.031 | 0.109 | 0.376 | -0.058 | -0.202 |
| -1.855999999999998 | 0.032 | 0.11 | 0.379 | -0.059 | -0.204 |
| -1.851999999999998 | 0.032 | 0.111 | 0.381 | -0.06 | -0.206 |
| -1.847999999999998 | 0.033 | 0.112 | 0.383 | -0.061 | -0.207 |
| -1.843999999999998 | 0.033 | 0.113 | 0.386 | -0.062 | -0.209 |
| -1.839999999999998 | 0.034 | 0.115 | 0.388 | -0.062 | -0.211 |
| -1.835999999999998 | 0.034 | 0.116 | 0.39 | -0.063 | -0.213 |
| -1.831999999999998 | 0.035 | 0.117 | 0.393 | -0.064 | -0.214 |
| -1.827999999999998 | 0.035 | 0.118 | 0.395 | -0.065 | -0.216 |
| -1.823999999999998 | 0.036 | 0.119 | 0.397 | -0.065 | -0.218 |
| -1.819999999999998 | 0.036 | 0.121 | 0.4 | -0.066 | -0.22 |
| -1.815999999999998 | 0.037 | 0.122 | 0.402 | -0.067 | -0.221 |
| -1.811999999999998 | 0.038 | 0.123 | 0.404 | -0.068 | -0.223 |
| -1.807999999999998 | 0.038 | 0.124 | 0.407 | -0.069 | -0.225 |
| -1.803999999999998 | 0.039 | 0.126 | 0.409 | -0.07 | -0.227 |
| -1.799999999999998 | 0.039 | 0.127 | 0.411 | -0.07 | -0.228 |
| -1.795999999999998 | 0.04 | 0.128 | 0.413 | -0.071 | -0.23 |
| -1.791999999999998 | 0.04 | 0.129 | 0.416 | -0.072 | -0.232 |
| -1.787999999999998 | 0.041 | 0.131 | 0.418 | -0.073 | -0.234 |
| -1.783999999999998 | 0.041 | 0.132 | 0.42 | -0.074 | -0.235 |
| -1.779999999999998 | 0.042 | 0.133 | 0.422 | -0.075 | -0.237 |
| -1.775999999999998 | 0.043 | 0.135 | 0.425 | -0.076 | -0.239 |
| -1.771999999999998 | 0.043 | 0.136 | 0.427 | -0.077 | -0.241 |
| -1.767999999999998 | 0.044 | 0.137 | 0.429 | -0.078 | -0.243 |
| -1.763999999999998 | 0.045 | 0.139 | 0.431 | -0.079 | -0.244 |
| -1.759999999999998 | 0.045 | 0.14 | 0.433 | -0.079 | -0.246 |
| -1.755999999999998 | 0.046 | 0.141 | 0.435 | -0.08 | -0.248 |
| -1.751999999999998 | 0.046 | 0.143 | 0.438 | -0.081 | -0.25 |
| -1.747999999999998 | 0.047 | 0.144 | 0.44 | -0.082 | -0.252 |
| -1.743999999999998 | 0.048 | 0.145 | 0.442 | -0.083 | -0.253 |
| -1.739999999999998 | 0.048 | 0.147 | 0.444 | -0.084 | -0.255 |
| -1.735999999999998 | 0.049 | 0.148 | 0.446 | -0.085 | -0.257 |
| -1.731999999999998 | 0.05 | 0.149 | 0.448 | -0.086 | -0.259 |
| -1.727999999999998 | 0.05 | 0.151 | 0.45 | -0.087 | -0.261 |
| -1.723999999999998 | 0.051 | 0.152 | 0.452 | -0.088 | -0.262 |
| -1.719999999999998 | 0.052 | 0.154 | 0.454 | -0.089 | -0.264 |
| -1.715999999999998 | 0.053 | 0.155 | 0.456 | -0.09 | -0.266 |
| -1.711999999999998 | 0.053 | 0.156 | 0.458 | -0.091 | -0.268 |
| -1.707999999999998 | 0.054 | 0.158 | 0.46 | -0.092 | -0.269 |
| -1.703999999999998 | 0.055 | 0.159 | 0.462 | -0.093 | -0.271 |
| -1.699999999999998 | 0.056 | 0.161 | 0.464 | -0.094 | -0.273 |
| -1.695999999999998 | 0.056 | 0.162 | 0.466 | -0.096 | -0.275 |
| -1.691999999999998 | 0.057 | 0.163 | 0.468 | -0.097 | -0.277 |
| -1.687999999999998 | 0.058 | 0.165 | 0.47 | -0.098 | -0.278 |
| -1.683999999999998 | 0.059 | 0.166 | 0.472 | -0.099 | -0.28 |
| -1.679999999999998 | 0.059 | 0.168 | 0.474 | -0.1 | -0.282 |
| -1.675999999999998 | 0.06 | 0.169 | 0.476 | -0.101 | -0.284 |
| -1.671999999999998 | 0.061 | 0.171 | 0.477 | -0.102 | -0.285 |
| -1.667999999999998 | 0.062 | 0.172 | 0.479 | -0.103 | -0.287 |
| -1.663999999999998 | 0.063 | 0.174 | 0.481 | -0.104 | -0.289 |
| -1.659999999999998 | 0.064 | 0.175 | 0.483 | -0.106 | -0.291 |
| -1.655999999999998 | 0.064 | 0.177 | 0.484 | -0.107 | -0.293 |
| -1.651999999999998 | 0.065 | 0.178 | 0.486 | -0.108 | -0.294 |
| -1.647999999999998 | 0.066 | 0.18 | 0.488 | -0.109 | -0.296 |
| -1.643999999999998 | 0.067 | 0.181 | 0.49 | -0.11 | -0.298 |
| -1.639999999999998 | 0.068 | 0.183 | 0.491 | -0.111 | -0.3 |
| -1.635999999999998 | 0.069 | 0.184 | 0.493 | -0.113 | -0.301 |
| -1.631999999999998 | 0.07 | 0.186 | 0.495 | -0.114 | -0.303 |
| -1.627999999999998 | 0.071 | 0.187 | 0.496 | -0.115 | -0.305 |
| -1.623999999999998 | 0.072 | 0.189 | 0.498 | -0.116 | -0.306 |
| -1.619999999999998 | 0.072 | 0.19 | 0.499 | -0.117 | -0.308 |
| -1.615999999999998 | 0.073 | 0.192 | 0.501 | -0.119 | -0.31 |
| -1.611999999999998 | 0.074 | 0.193 | 0.502 | -0.12 | -0.312 |
| -1.607999999999998 | 0.075 | 0.195 | 0.504 | -0.121 | -0.313 |
| -1.603999999999998 | 0.076 | 0.196 | 0.505 | -0.122 | -0.315 |
| -1.599999999999998 | 0.077 | 0.198 | 0.507 | -0.124 | -0.317 |
| -1.595999999999998 | 0.078 | 0.199 | 0.508 | -0.125 | -0.318 |
| -1.591999999999998 | 0.079 | 0.201 | 0.509 | -0.126 | -0.32 |
| -1.587999999999998 | 0.08 | 0.203 | 0.511 | -0.128 | -0.322 |
| -1.583999999999998 | 0.081 | 0.204 | 0.512 | -0.129 | -0.323 |
| -1.579999999999998 | 0.082 | 0.206 | 0.513 | -0.13 | -0.325 |
| -1.575999999999998 | 0.083 | 0.207 | 0.515 | -0.131 | -0.327 |
| -1.571999999999998 | 0.084 | 0.209 | 0.516 | -0.133 | -0.328 |
| -1.567999999999998 | 0.086 | 0.21 | 0.517 | -0.134 | -0.33 |
| -1.563999999999998 | 0.087 | 0.212 | 0.518 | -0.135 | -0.331 |
| -1.559999999999998 | 0.088 | 0.213 | 0.52 | -0.137 | -0.333 |
| -1.555999999999998 | 0.089 | 0.215 | 0.521 | -0.138 | -0.335 |
| -1.551999999999998 | 0.09 | 0.217 | 0.522 | -0.14 | -0.336 |
| -1.547999999999998 | 0.091 | 0.218 | 0.523 | -0.141 | -0.338 |
| -1.543999999999998 | 0.092 | 0.22 | 0.524 | -0.142 | -0.339 |
| -1.539999999999998 | 0.093 | 0.221 | 0.525 | -0.144 | -0.341 |
| -1.535999999999998 | 0.094 | 0.223 | 0.526 | -0.145 | -0.342 |
| -1.531999999999998 | 0.096 | 0.225 | 0.527 | -0.147 | -0.344 |
| -1.527999999999998 | 0.097 | 0.226 | 0.528 | -0.148 | -0.345 |
| -1.523999999999998 | 0.098 | 0.228 | 0.529 | -0.149 | -0.347 |
| -1.519999999999998 | 0.099 | 0.229 | 0.53 | -0.151 | -0.348 |
| -1.515999999999998 | 0.1 | 0.231 | 0.53 | -0.152 | -0.35 |
| -1.511999999999998 | 0.102 | 0.232 | 0.531 | -0.154 | -0.351 |
| -1.507999999999998 | 0.103 | 0.234 | 0.532 | -0.155 | -0.353 |
| -1.503999999999998 | 0.104 | 0.236 | 0.533 | -0.157 | -0.354 |
| -1.499999999999998 | 0.105 | 0.237 | 0.534 | -0.158 | -0.356 |
| -1.495999999999998 | 0.107 | 0.239 | 0.534 | -0.16 | -0.357 |
| -1.491999999999998 | 0.108 | 0.24 | 0.535 | -0.161 | -0.359 |
| -1.487999999999998 | 0.109 | 0.242 | 0.536 | -0.163 | -0.36 |
| -1.483999999999998 | 0.111 | 0.243 | 0.536 | -0.164 | -0.361 |
| -1.479999999999998 | 0.112 | 0.245 | 0.537 | -0.166 | -0.363 |
| -1.475999999999998 | 0.113 | 0.247 | 0.537 | -0.167 | -0.364 |
| -1.471999999999998 | 0.115 | 0.248 | 0.538 | -0.169 | -0.365 |
| -1.467999999999998 | 0.116 | 0.25 | 0.538 | -0.17 | -0.367 |
| -1.463999999999998 | 0.117 | 0.251 | 0.539 | -0.172 | -0.368 |
| -1.459999999999998 | 0.119 | 0.253 | 0.539 | -0.173 | -0.369 |
| -1.455999999999998 | 0.12 | 0.254 | 0.539 | -0.175 | -0.371 |
| -1.451999999999998 | 0.121 | 0.256 | 0.54 | -0.176 | -0.372 |
| -1.447999999999998 | 0.123 | 0.258 | 0.54 | -0.178 | -0.373 |
| -1.443999999999998 | 0.124 | 0.259 | 0.54 | -0.179 | -0.374 |
| -1.439999999999998 | 0.126 | 0.261 | 0.541 | -0.181 | -0.375 |
| -1.435999999999998 | 0.127 | 0.262 | 0.541 | -0.183 | -0.377 |
| -1.431999999999998 | 0.129 | 0.264 | 0.541 | -0.184 | -0.378 |
| -1.427999999999998 | 0.13 | 0.265 | 0.541 | -0.186 | -0.379 |
| -1.423999999999998 | 0.132 | 0.267 | 0.541 | -0.187 | -0.38 |
| -1.419999999999998 | 0.133 | 0.268 | 0.541 | -0.189 | -0.381 |
| -1.415999999999998 | 0.135 | 0.27 | 0.541 | -0.191 | -0.382 |
| -1.411999999999998 | 0.136 | 0.272 | 0.541 | -0.192 | -0.383 |
| -1.407999999999998 | 0.138 | 0.273 | 0.541 | -0.194 | -0.384 |
| -1.403999999999998 | 0.139 | 0.275 | 0.541 | -0.196 | -0.385 |
| -1.399999999999998 | 0.141 | 0.276 | 0.541 | -0.197 | -0.387 |
| -1.395999999999998 | 0.142 | 0.278 | 0.541 | -0.199 | -0.388 |
| -1.391999999999998 | 0.144 | 0.279 | 0.541 | -0.201 | -0.389 |
| -1.387999999999998 | 0.146 | 0.281 | 0.541 | -0.202 | -0.389 |
| -1.383999999999998 | 0.147 | 0.282 | 0.54 | -0.204 | -0.39 |
| -1.379999999999998 | 0.149 | 0.284 | 0.54 | -0.205 | -0.391 |
| -1.375999999999998 | 0.151 | 0.285 | 0.54 | -0.207 | -0.392 |
| -1.371999999999998 | 0.152 | 0.287 | 0.539 | -0.209 | -0.393 |
| -1.367999999999998 | 0.154 | 0.288 | 0.539 | -0.211 | -0.394 |
| -1.363999999999998 | 0.156 | 0.289 | 0.539 | -0.212 | -0.395 |
| -1.359999999999998 | 0.157 | 0.291 | 0.538 | -0.214 | -0.396 |
| -1.355999999999998 | 0.159 | 0.292 | 0.538 | -0.216 | -0.396 |
| -1.351999999999998 | 0.161 | 0.294 | 0.537 | -0.217 | -0.397 |
| -1.347999999999998 | 0.162 | 0.295 | 0.537 | -0.219 | -0.398 |
| -1.343999999999998 | 0.164 | 0.297 | 0.536 | -0.221 | -0.399 |
| -1.339999999999998 | 0.166 | 0.298 | 0.535 | -0.222 | -0.399 |
| -1.335999999999998 | 0.168 | 0.3 | 0.535 | -0.224 | -0.4 |
| -1.331999999999998 | 0.17 | 0.301 | 0.534 | -0.226 | -0.401 |
| -1.327999999999998 | 0.171 | 0.302 | 0.533 | -0.228 | -0.401 |
| -1.323999999999998 | 0.173 | 0.304 | 0.532 | -0.229 | -0.402 |
| -1.319999999999998 | 0.175 | 0.305 | 0.532 | -0.231 | -0.403 |
| -1.315999999999998 | 0.177 | 0.306 | 0.531 | -0.233 | -0.403 |
| -1.311999999999998 | 0.179 | 0.308 | 0.53 | -0.235 | -0.404 |
| -1.307999999999998 | 0.181 | 0.309 | 0.529 | -0.236 | -0.404 |
| -1.303999999999998 | 0.183 | 0.311 | 0.528 | -0.238 | -0.405 |
| -1.299999999999998 | 0.185 | 0.312 | 0.527 | -0.24 | -0.405 |
| -1.295999999999998 | 0.186 | 0.313 | 0.526 | -0.242 | -0.406 |
| -1.291999999999998 | 0.188 | 0.314 | 0.525 | -0.243 | -0.406 |
| -1.287999999999998 | 0.19 | 0.316 | 0.524 | -0.245 | -0.407 |
| -1.283999999999998 | 0.192 | 0.317 | 0.523 | -0.247 | -0.407 |
| -1.279999999999998 | 0.194 | 0.318 | 0.522 | -0.249 | -0.407 |
| -1.275999999999998 | 0.196 | 0.32 | 0.52 | -0.25 | -0.408 |
| -1.271999999999998 | 0.198 | 0.321 | 0.519 | -0.252 | -0.408 |
| -1.267999999999998 | 0.2 | 0.322 | 0.518 | -0.254 | -0.408 |
| -1.263999999999998 | 0.202 | 0.323 | 0.517 | -0.256 | -0.409 |
| -1.259999999999998 | 0.204 | 0.325 | 0.515 | -0.258 | -0.409 |
| -1.255999999999998 | 0.206 | 0.326 | 0.514 | -0.259 | -0.409 |
| -1.251999999999998 | 0.209 | 0.327 | 0.512 | -0.261 | -0.409 |
| -1.247999999999998 | 0.211 | 0.328 | 0.511 | -0.263 | -0.409 |
| -1.243999999999998 | 0.213 | 0.329 | 0.51 | -0.265 | -0.41 |
| -1.239999999999998 | 0.215 | 0.33 | 0.508 | -0.266 | -0.41 |
| -1.235999999999998 | 0.217 | 0.332 | 0.507 | -0.268 | -0.41 |
| -1.231999999999998 | 0.219 | 0.333 | 0.505 | -0.27 | -0.41 |
| -1.227999999999998 | 0.221 | 0.334 | 0.503 | -0.272 | -0.41 |
| -1.223999999999998 | 0.224 | 0.335 | 0.502 | -0.274 | -0.41 |
| -1.219999999999998 | 0.226 | 0.336 | 0.5 | -0.275 | -0.41 |
| -1.215999999999998 | 0.228 | 0.337 | 0.498 | -0.277 | -0.41 |
| -1.211999999999998 | 0.23 | 0.338 | 0.497 | -0.279 | -0.41 |
| -1.207999999999998 | 0.232 | 0.339 | 0.495 | -0.281 | -0.41 |
| -1.203999999999998 | 0.235 | 0.34 | 0.493 | -0.283 | -0.41 |
| -1.199999999999997 | 0.237 | 0.341 | 0.491 | -0.284 | -0.409 |
| -1.195999999999997 | 0.239 | 0.342 | 0.489 | -0.286 | -0.409 |
| -1.191999999999997 | 0.242 | 0.343 | 0.488 | -0.288 | -0.409 |
| -1.187999999999997 | 0.244 | 0.344 | 0.486 | -0.29 | -0.409 |
| -1.183999999999997 | 0.246 | 0.345 | 0.484 | -0.291 | -0.409 |
| -1.179999999999997 | 0.248 | 0.346 | 0.482 | -0.293 | -0.408 |
| -1.175999999999997 | 0.251 | 0.347 | 0.48 | -0.295 | -0.408 |
| -1.171999999999997 | 0.253 | 0.348 | 0.478 | -0.297 | -0.408 |
| -1.167999999999997 | 0.256 | 0.349 | 0.476 | -0.299 | -0.407 |
| -1.163999999999997 | 0.258 | 0.35 | 0.474 | -0.3 | -0.407 |
| -1.159999999999997 | 0.26 | 0.35 | 0.471 | -0.302 | -0.406 |
| -1.155999999999997 | 0.263 | 0.351 | 0.469 | -0.304 | -0.406 |
| -1.151999999999997 | 0.265 | 0.352 | 0.467 | -0.306 | -0.406 |
| -1.147999999999997 | 0.268 | 0.353 | 0.465 | -0.307 | -0.405 |
| -1.143999999999997 | 0.27 | 0.354 | 0.463 | -0.309 | -0.404 |
| -1.139999999999997 | 0.273 | 0.354 | 0.46 | -0.311 | -0.404 |
| -1.135999999999997 | 0.275 | 0.355 | 0.458 | -0.313 | -0.403 |
| -1.131999999999997 | 0.278 | 0.356 | 0.456 | -0.314 | -0.403 |
| -1.127999999999997 | 0.28 | 0.356 | 0.454 | -0.316 | -0.402 |
| -1.123999999999997 | 0.283 | 0.357 | 0.451 | -0.318 | -0.401 |
| -1.119999999999997 | 0.285 | 0.358 | 0.449 | -0.319 | -0.401 |
| -1.115999999999997 | 0.288 | 0.358 | 0.446 | -0.321 | -0.4 |
| -1.111999999999997 | 0.29 | 0.359 | 0.444 | -0.323 | -0.399 |
| -1.107999999999997 | 0.293 | 0.36 | 0.442 | -0.325 | -0.399 |
| -1.103999999999997 | 0.296 | 0.36 | 0.439 | -0.326 | -0.398 |
| -1.099999999999997 | 0.298 | 0.361 | 0.437 | -0.328 | -0.397 |
| -1.095999999999997 | 0.301 | 0.361 | 0.434 | -0.33 | -0.396 |
| -1.091999999999997 | 0.303 | 0.362 | 0.432 | -0.331 | -0.395 |
| -1.087999999999997 | 0.306 | 0.362 | 0.429 | -0.333 | -0.394 |
| -1.083999999999997 | 0.309 | 0.363 | 0.426 | -0.335 | -0.393 |
| -1.079999999999997 | 0.311 | 0.363 | 0.424 | -0.336 | -0.392 |
| -1.075999999999997 | 0.314 | 0.364 | 0.421 | -0.338 | -0.391 |
| -1.071999999999997 | 0.317 | 0.364 | 0.418 | -0.34 | -0.39 |
| -1.067999999999997 | 0.32 | 0.365 | 0.416 | -0.341 | -0.389 |
| -1.063999999999997 | 0.322 | 0.365 | 0.413 | -0.343 | -0.388 |
| -1.059999999999997 | 0.325 | 0.365 | 0.41 | -0.345 | -0.387 |
| -1.055999999999997 | 0.328 | 0.366 | 0.408 | -0.346 | -0.386 |
| -1.051999999999997 | 0.331 | 0.366 | 0.405 | -0.348 | -0.385 |
| -1.047999999999997 | 0.333 | 0.366 | 0.402 | -0.349 | -0.384 |
| -1.043999999999997 | 0.336 | 0.366 | 0.399 | -0.351 | -0.383 |
| -1.039999999999997 | 0.339 | 0.367 | 0.397 | -0.353 | -0.381 |
| -1.035999999999997 | 0.342 | 0.367 | 0.394 | -0.354 | -0.38 |
| -1.031999999999997 | 0.345 | 0.367 | 0.391 | -0.356 | -0.379 |
| -1.027999999999997 | 0.348 | 0.367 | 0.388 | -0.357 | -0.378 |
| -1.023999999999997 | 0.35 | 0.367 | 0.385 | -0.359 | -0.376 |
| -1.019999999999997 | 0.353 | 0.368 | 0.382 | -0.36 | -0.375 |
| -1.015999999999997 | 0.356 | 0.368 | 0.38 | -0.362 | -0.374 |
| -1.011999999999997 | 0.359 | 0.368 | 0.377 | -0.363 | -0.372 |
| -1.007999999999997 | 0.362 | 0.368 | 0.374 | -0.365 | -0.371 |
| -1.003999999999997 | 0.365 | 0.368 | 0.371 | -0.366 | -0.369 |
| -0.999999999999997 | 0.368 | 0.368 | 0.368 | -0.368 | -0.368 |
| -0.995999999999997 | 0.371 | 0.368 | 0.365 | -0.369 | -0.366 |
| -0.991999999999997 | 0.374 | 0.368 | 0.362 | -0.371 | -0.365 |
| -0.987999999999997 | 0.377 | 0.368 | 0.359 | -0.372 | -0.363 |
| -0.983999999999997 | 0.38 | 0.368 | 0.356 | -0.374 | -0.362 |
| -0.979999999999997 | 0.383 | 0.368 | 0.353 | -0.375 | -0.36 |
| -0.975999999999997 | 0.386 | 0.367 | 0.35 | -0.376 | -0.359 |
| -0.971999999999997 | 0.389 | 0.367 | 0.347 | -0.378 | -0.357 |
| -0.967999999999997 | 0.392 | 0.367 | 0.344 | -0.379 | -0.355 |
| -0.963999999999997 | 0.395 | 0.367 | 0.341 | -0.381 | -0.354 |
| -0.959999999999997 | 0.398 | 0.367 | 0.338 | -0.382 | -0.352 |
| -0.955999999999997 | 0.401 | 0.366 | 0.335 | -0.383 | -0.35 |
| -0.951999999999997 | 0.404 | 0.366 | 0.332 | -0.385 | -0.349 |
| -0.947999999999997 | 0.407 | 0.366 | 0.329 | -0.386 | -0.347 |
| -0.943999999999997 | 0.41 | 0.366 | 0.326 | -0.387 | -0.345 |
| -0.939999999999997 | 0.413 | 0.365 | 0.323 | -0.388 | -0.343 |
| -0.935999999999997 | 0.416 | 0.365 | 0.32 | -0.39 | -0.341 |
| -0.931999999999997 | 0.42 | 0.364 | 0.317 | -0.391 | -0.34 |
| -0.927999999999997 | 0.423 | 0.364 | 0.313 | -0.392 | -0.338 |
| -0.923999999999997 | 0.426 | 0.364 | 0.31 | -0.393 | -0.336 |
| -0.919999999999997 | 0.429 | 0.363 | 0.307 | -0.395 | -0.334 |
| -0.915999999999997 | 0.432 | 0.363 | 0.304 | -0.396 | -0.332 |
| -0.911999999999997 | 0.435 | 0.362 | 0.301 | -0.397 | -0.33 |
| -0.907999999999997 | 0.438 | 0.362 | 0.298 | -0.398 | -0.328 |
| -0.903999999999997 | 0.442 | 0.361 | 0.295 | -0.399 | -0.326 |
| -0.899999999999997 | 0.445 | 0.36 | 0.292 | -0.4 | -0.324 |
| -0.895999999999997 | 0.448 | 0.36 | 0.289 | -0.401 | -0.322 |
| -0.891999999999997 | 0.451 | 0.359 | 0.286 | -0.403 | -0.32 |
| -0.887999999999997 | 0.455 | 0.358 | 0.283 | -0.404 | -0.318 |
| -0.883999999999997 | 0.458 | 0.358 | 0.28 | -0.405 | -0.316 |
| -0.879999999999997 | 0.461 | 0.357 | 0.276 | -0.406 | -0.314 |
| -0.875999999999997 | 0.464 | 0.356 | 0.273 | -0.407 | -0.312 |
| -0.871999999999997 | 0.467 | 0.355 | 0.27 | -0.408 | -0.31 |
| -0.867999999999997 | 0.471 | 0.355 | 0.267 | -0.409 | -0.308 |
| -0.863999999999997 | 0.474 | 0.354 | 0.264 | -0.41 | -0.306 |
| -0.859999999999997 | 0.477 | 0.353 | 0.261 | -0.41 | -0.304 |
| -0.855999999999997 | 0.481 | 0.352 | 0.258 | -0.411 | -0.301 |
| -0.851999999999997 | 0.484 | 0.351 | 0.255 | -0.412 | -0.299 |
| -0.847999999999997 | 0.487 | 0.35 | 0.252 | -0.413 | -0.297 |
| -0.843999999999997 | 0.49 | 0.349 | 0.249 | -0.414 | -0.295 |
| -0.839999999999997 | 0.494 | 0.348 | 0.246 | -0.415 | -0.293 |
| -0.835999999999997 | 0.497 | 0.347 | 0.243 | -0.416 | -0.29 |
| -0.831999999999997 | 0.5 | 0.346 | 0.24 | -0.416 | -0.288 |
| -0.827999999999997 | 0.504 | 0.345 | 0.237 | -0.417 | -0.286 |
| -0.823999999999997 | 0.507 | 0.344 | 0.234 | -0.418 | -0.284 |
| -0.819999999999997 | 0.51 | 0.343 | 0.231 | -0.419 | -0.281 |
| -0.815999999999997 | 0.514 | 0.342 | 0.228 | -0.419 | -0.279 |
| -0.811999999999997 | 0.517 | 0.341 | 0.225 | -0.42 | -0.277 |
| -0.807999999999997 | 0.521 | 0.34 | 0.222 | -0.421 | -0.275 |
| -0.803999999999997 | 0.524 | 0.339 | 0.219 | -0.421 | -0.272 |
| -0.799999999999997 | 0.527 | 0.337 | 0.216 | -0.422 | -0.27 |
| -0.795999999999997 | 0.531 | 0.336 | 0.213 | -0.422 | -0.268 |
| -0.791999999999997 | 0.534 | 0.335 | 0.21 | -0.423 | -0.265 |
| -0.787999999999997 | 0.537 | 0.334 | 0.207 | -0.424 | -0.263 |
| -0.783999999999997 | 0.541 | 0.332 | 0.204 | -0.424 | -0.261 |
| -0.779999999999997 | 0.544 | 0.331 | 0.201 | -0.424 | -0.258 |
| -0.775999999999997 | 0.548 | 0.33 | 0.199 | -0.425 | -0.256 |
| -0.771999999999997 | 0.551 | 0.328 | 0.196 | -0.425 | -0.254 |
| -0.767999999999997 | 0.554 | 0.327 | 0.193 | -0.426 | -0.251 |
| -0.763999999999997 | 0.558 | 0.326 | 0.19 | -0.426 | -0.249 |
| -0.759999999999997 | 0.561 | 0.324 | 0.187 | -0.427 | -0.246 |
| -0.755999999999997 | 0.565 | 0.323 | 0.184 | -0.427 | -0.244 |
| -0.751999999999997 | 0.568 | 0.321 | 0.182 | -0.427 | -0.242 |
| -0.747999999999997 | 0.571 | 0.32 | 0.179 | -0.427 | -0.239 |
| -0.743999999999997 | 0.575 | 0.318 | 0.176 | -0.428 | -0.237 |
| -0.739999999999997 | 0.578 | 0.317 | 0.173 | -0.428 | -0.234 |
| -0.735999999999997 | 0.582 | 0.315 | 0.171 | -0.428 | -0.232 |
| -0.731999999999997 | 0.585 | 0.314 | 0.168 | -0.428 | -0.23 |
| -0.727999999999997 | 0.589 | 0.312 | 0.165 | -0.429 | -0.227 |
| -0.723999999999997 | 0.592 | 0.31 | 0.163 | -0.429 | -0.225 |
| -0.719999999999997 | 0.595 | 0.309 | 0.16 | -0.429 | -0.222 |
| -0.715999999999997 | 0.599 | 0.307 | 0.157 | -0.429 | -0.22 |
| -0.711999999999997 | 0.602 | 0.305 | 0.155 | -0.429 | -0.217 |
| -0.707999999999997 | 0.606 | 0.304 | 0.152 | -0.429 | -0.215 |
| -0.703999999999997 | 0.609 | 0.302 | 0.15 | -0.429 | -0.213 |
| -0.699999999999997 | 0.613 | 0.3 | 0.147 | -0.429 | -0.21 |
| -0.695999999999997 | 0.616 | 0.298 | 0.145 | -0.429 | -0.208 |
| -0.691999999999997 | 0.619 | 0.297 | 0.142 | -0.429 | -0.205 |
| -0.687999999999997 | 0.623 | 0.295 | 0.14 | -0.429 | -0.203 |
| -0.683999999999997 | 0.626 | 0.293 | 0.137 | -0.428 | -0.2 |
| -0.679999999999997 | 0.63 | 0.291 | 0.135 | -0.428 | -0.198 |
| -0.675999999999997 | 0.633 | 0.289 | 0.132 | -0.428 | -0.196 |
| -0.671999999999997 | 0.637 | 0.287 | 0.13 | -0.428 | -0.193 |
| -0.667999999999997 | 0.64 | 0.286 | 0.127 | -0.428 | -0.191 |
| -0.663999999999997 | 0.643 | 0.284 | 0.125 | -0.427 | -0.188 |
| -0.659999999999997 | 0.647 | 0.282 | 0.123 | -0.427 | -0.186 |
| -0.655999999999997 | 0.65 | 0.28 | 0.12 | -0.427 | -0.184 |
| -0.651999999999997 | 0.654 | 0.278 | 0.118 | -0.426 | -0.181 |
| -0.647999999999997 | 0.657 | 0.276 | 0.116 | -0.426 | -0.179 |
| -0.643999999999997 | 0.661 | 0.274 | 0.114 | -0.425 | -0.176 |
| -0.639999999999997 | 0.664 | 0.272 | 0.111 | -0.425 | -0.174 |
| -0.635999999999997 | 0.667 | 0.27 | 0.109 | -0.424 | -0.172 |
| -0.631999999999997 | 0.671 | 0.268 | 0.107 | -0.424 | -0.169 |
| -0.627999999999997 | 0.674 | 0.266 | 0.105 | -0.423 | -0.167 |
| -0.623999999999997 | 0.677 | 0.264 | 0.103 | -0.423 | -0.165 |
| -0.619999999999997 | 0.681 | 0.262 | 0.101 | -0.422 | -0.162 |
| -0.615999999999997 | 0.684 | 0.26 | 0.099 | -0.421 | -0.16 |
| -0.611999999999997 | 0.688 | 0.258 | 0.096 | -0.421 | -0.158 |
| -0.607999999999997 | 0.691 | 0.255 | 0.094 | -0.42 | -0.155 |
| -0.603999999999997 | 0.694 | 0.253 | 0.092 | -0.419 | -0.153 |
| -0.599999999999997 | 0.698 | 0.251 | 0.09 | -0.419 | -0.151 |
| -0.595999999999997 | 0.701 | 0.249 | 0.088 | -0.418 | -0.148 |
| -0.591999999999997 | 0.704 | 0.247 | 0.087 | -0.417 | -0.146 |
| -0.587999999999997 | 0.708 | 0.245 | 0.085 | -0.416 | -0.144 |
| -0.583999999999997 | 0.711 | 0.242 | 0.083 | -0.415 | -0.142 |
| -0.579999999999997 | 0.714 | 0.24 | 0.081 | -0.414 | -0.139 |
| -0.575999999999997 | 0.718 | 0.238 | 0.079 | -0.413 | -0.137 |
| -0.571999999999997 | 0.721 | 0.236 | 0.077 | -0.412 | -0.135 |
| -0.567999999999997 | 0.724 | 0.234 | 0.075 | -0.411 | -0.133 |
| -0.563999999999997 | 0.728 | 0.231 | 0.074 | -0.41 | -0.131 |
| -0.559999999999997 | 0.731 | 0.229 | 0.072 | -0.409 | -0.128 |
| -0.555999999999997 | 0.734 | 0.227 | 0.07 | -0.408 | -0.126 |
| -0.551999999999997 | 0.737 | 0.225 | 0.068 | -0.407 | -0.124 |
| -0.547999999999997 | 0.741 | 0.222 | 0.067 | -0.406 | -0.122 |
| -0.543999999999997 | 0.744 | 0.22 | 0.065 | -0.405 | -0.12 |
| -0.539999999999997 | 0.747 | 0.218 | 0.064 | -0.403 | -0.118 |
| -0.535999999999997 | 0.75 | 0.216 | 0.062 | -0.402 | -0.116 |
| -0.531999999999997 | 0.754 | 0.213 | 0.06 | -0.401 | -0.113 |
| -0.527999999999997 | 0.757 | 0.211 | 0.059 | -0.4 | -0.111 |
| -0.523999999999997 | 0.76 | 0.209 | 0.057 | -0.398 | -0.109 |
| -0.519999999999997 | 0.763 | 0.206 | 0.056 | -0.397 | -0.107 |
| -0.515999999999997 | 0.766 | 0.204 | 0.054 | -0.395 | -0.105 |
| -0.511999999999997 | 0.769 | 0.202 | 0.053 | -0.394 | -0.103 |
| -0.507999999999997 | 0.773 | 0.199 | 0.051 | -0.392 | -0.101 |
| -0.503999999999997 | 0.776 | 0.197 | 0.05 | -0.391 | -0.099 |
| -0.499999999999997 | 0.779 | 0.195 | 0.049 | -0.389 | -0.097 |
| -0.495999999999997 | 0.782 | 0.192 | 0.047 | -0.388 | -0.095 |
| -0.491999999999997 | 0.785 | 0.19 | 0.046 | -0.386 | -0.093 |
| -0.487999999999997 | 0.788 | 0.188 | 0.045 | -0.385 | -0.092 |
| -0.483999999999997 | 0.791 | 0.185 | 0.043 | -0.383 | -0.09 |
| -0.479999999999997 | 0.794 | 0.183 | 0.042 | -0.381 | -0.088 |
| -0.475999999999997 | 0.797 | 0.181 | 0.041 | -0.379 | -0.086 |
| -0.471999999999997 | 0.8 | 0.178 | 0.04 | -0.378 | -0.084 |
| -0.467999999999997 | 0.803 | 0.176 | 0.039 | -0.376 | -0.082 |
| -0.463999999999997 | 0.806 | 0.174 | 0.037 | -0.374 | -0.081 |
| -0.459999999999997 | 0.809 | 0.171 | 0.036 | -0.372 | -0.079 |
| -0.455999999999997 | 0.812 | 0.169 | 0.035 | -0.37 | -0.077 |
| -0.451999999999997 | 0.815 | 0.167 | 0.034 | -0.368 | -0.075 |
| -0.447999999999997 | 0.818 | 0.164 | 0.033 | -0.367 | -0.074 |
| -0.443999999999997 | 0.821 | 0.162 | 0.032 | -0.365 | -0.072 |
| -0.439999999999997 | 0.824 | 0.16 | 0.031 | -0.363 | -0.07 |
| -0.435999999999997 | 0.827 | 0.157 | 0.03 | -0.361 | -0.069 |
| -0.431999999999997 | 0.83 | 0.155 | 0.029 | -0.358 | -0.067 |
| -0.427999999999997 | 0.833 | 0.153 | 0.028 | -0.356 | -0.065 |
| -0.423999999999997 | 0.835 | 0.15 | 0.027 | -0.354 | -0.064 |
| -0.419999999999997 | 0.838 | 0.148 | 0.026 | -0.352 | -0.062 |
| -0.415999999999997 | 0.841 | 0.146 | 0.025 | -0.35 | -0.061 |
| -0.411999999999997 | 0.844 | 0.143 | 0.024 | -0.348 | -0.059 |
| -0.407999999999997 | 0.847 | 0.141 | 0.023 | -0.345 | -0.058 |
| -0.403999999999997 | 0.849 | 0.139 | 0.023 | -0.343 | -0.056 |
| -0.399999999999997 | 0.852 | 0.136 | 0.022 | -0.341 | -0.055 |
| -0.395999999999997 | 0.855 | 0.134 | 0.021 | -0.339 | -0.053 |
| -0.391999999999997 | 0.858 | 0.132 | 0.02 | -0.336 | -0.052 |
| -0.387999999999997 | 0.86 | 0.13 | 0.019 | -0.334 | -0.05 |
| -0.383999999999997 | 0.863 | 0.127 | 0.019 | -0.331 | -0.049 |
| -0.379999999999997 | 0.866 | 0.125 | 0.018 | -0.329 | -0.047 |
| -0.375999999999997 | 0.868 | 0.123 | 0.017 | -0.326 | -0.046 |
| -0.371999999999997 | 0.871 | 0.12 | 0.017 | -0.324 | -0.045 |
| -0.367999999999997 | 0.873 | 0.118 | 0.016 | -0.321 | -0.044 |
| -0.363999999999997 | 0.876 | 0.116 | 0.015 | -0.319 | -0.042 |
| -0.359999999999997 | 0.878 | 0.114 | 0.015 | -0.316 | -0.041 |
| -0.355999999999997 | 0.881 | 0.112 | 0.014 | -0.314 | -0.04 |
| -0.351999999999997 | 0.883 | 0.109 | 0.014 | -0.311 | -0.039 |
| -0.347999999999997 | 0.886 | 0.107 | 0.013 | -0.308 | -0.037 |
| -0.343999999999997 | 0.888 | 0.105 | 0.012 | -0.306 | -0.036 |
| -0.339999999999997 | 0.891 | 0.103 | 0.012 | -0.303 | -0.035 |
| -0.335999999999997 | 0.893 | 0.101 | 0.011 | -0.3 | -0.034 |
| -0.331999999999997 | 0.896 | 0.099 | 0.011 | -0.297 | -0.033 |
| -0.327999999999997 | 0.898 | 0.097 | 0.01 | -0.295 | -0.032 |
| -0.323999999999997 | 0.9 | 0.095 | 0.01 | -0.292 | -0.031 |
| -0.319999999999997 | 0.903 | 0.092 | 0.009 | -0.289 | -0.03 |
| -0.315999999999997 | 0.905 | 0.09 | 0.009 | -0.286 | -0.029 |
| -0.311999999999997 | 0.907 | 0.088 | 0.009 | -0.283 | -0.028 |
| -0.307999999999997 | 0.909 | 0.086 | 0.008 | -0.28 | -0.027 |
| -0.303999999999997 | 0.912 | 0.084 | 0.008 | -0.277 | -0.026 |
| -0.299999999999997 | 0.914 | 0.082 | 0.007 | -0.274 | -0.025 |
| -0.295999999999997 | 0.916 | 0.08 | 0.007 | -0.271 | -0.024 |
| -0.291999999999997 | 0.918 | 0.078 | 0.007 | -0.268 | -0.023 |
| -0.287999999999997 | 0.92 | 0.076 | 0.006 | -0.265 | -0.022 |
| -0.283999999999997 | 0.923 | 0.074 | 0.006 | -0.262 | -0.021 |
| -0.279999999999997 | 0.925 | 0.072 | 0.006 | -0.259 | -0.02 |
| -0.275999999999997 | 0.927 | 0.071 | 0.005 | -0.256 | -0.019 |
| -0.271999999999997 | 0.929 | 0.069 | 0.005 | -0.253 | -0.019 |
| -0.267999999999997 | 0.931 | 0.067 | 0.005 | -0.249 | -0.018 |
| -0.263999999999997 | 0.933 | 0.065 | 0.005 | -0.246 | -0.017 |
| -0.259999999999997 | 0.935 | 0.063 | 0.004 | -0.243 | -0.016 |
| -0.255999999999997 | 0.937 | 0.061 | 0.004 | -0.24 | -0.016 |
| -0.251999999999997 | 0.938 | 0.06 | 0.004 | -0.236 | -0.015 |
| -0.247999999999997 | 0.94 | 0.058 | 0.004 | -0.233 | -0.014 |
| -0.243999999999997 | 0.942 | 0.056 | 0.003 | -0.23 | -0.014 |
| -0.239999999999997 | 0.944 | 0.054 | 0.003 | -0.227 | -0.013 |
| -0.235999999999997 | 0.946 | 0.053 | 0.003 | -0.223 | -0.012 |
| -0.231999999999997 | 0.948 | 0.051 | 0.003 | -0.22 | -0.012 |
| -0.227999999999997 | 0.949 | 0.049 | 0.003 | -0.216 | -0.011 |
| -0.223999999999997 | 0.951 | 0.048 | 0.002 | -0.213 | -0.011 |
| -0.219999999999997 | 0.953 | 0.046 | 0.002 | -0.21 | -0.01 |
| -0.215999999999997 | 0.954 | 0.045 | 0.002 | -0.206 | -0.01 |
| -0.211999999999997 | 0.956 | 0.043 | 0.002 | -0.203 | -0.009 |
| -0.207999999999997 | 0.958 | 0.041 | 0.002 | -0.199 | -0.009 |
| -0.203999999999997 | 0.959 | 0.04 | 0.002 | -0.196 | -0.008 |
| -0.199999999999997 | 0.961 | 0.038 | 0.002 | -0.192 | -0.008 |
| -0.195999999999997 | 0.962 | 0.037 | 0.001 | -0.189 | -0.007 |
| -0.191999999999997 | 0.964 | 0.036 | 0.001 | -0.185 | -0.007 |
| -0.187999999999997 | 0.965 | 0.034 | 0.001 | -0.181 | -0.006 |
| -0.183999999999997 | 0.967 | 0.033 | 0.001 | -0.178 | -0.006 |
| -0.179999999999997 | 0.968 | 0.031 | 0.001 | -0.174 | -0.006 |
| -0.175999999999997 | 0.969 | 0.03 | 0.001 | -0.171 | -0.005 |
| -0.171999999999997 | 0.971 | 0.029 | 0.001 | -0.167 | -0.005 |
| -0.167999999999997 | 0.972 | 0.027 | 0.001 | -0.163 | -0.005 |
| -0.163999999999997 | 0.973 | 0.026 | 0.001 | -0.16 | -0.004 |
| -0.159999999999997 | 0.975 | 0.025 | 0.001 | -0.156 | -0.004 |
| -0.155999999999997 | 0.976 | 0.024 | 0.001 | -0.152 | -0.004 |
| -0.151999999999997 | 0.977 | 0.023 | 0.001 | -0.149 | -0.003 |
| -0.147999999999997 | 0.978 | 0.021 | 0 | -0.145 | -0.003 |
| -0.143999999999997 | 0.979 | 0.02 | 0 | -0.141 | -0.003 |
| -0.139999999999997 | 0.981 | 0.019 | 0 | -0.137 | -0.003 |
| -0.135999999999997 | 0.982 | 0.018 | 0 | -0.134 | -0.002 |
| -0.131999999999997 | 0.983 | 0.017 | 0 | -0.13 | -0.002 |
| -0.127999999999997 | 0.984 | 0.016 | 0 | -0.126 | -0.002 |
| -0.123999999999997 | 0.985 | 0.015 | 0 | -0.122 | -0.002 |
| -0.119999999999997 | 0.986 | 0.014 | 0 | -0.118 | -0.002 |
| -0.115999999999997 | 0.987 | 0.013 | 0 | -0.114 | -0.002 |
| -0.111999999999997 | 0.988 | 0.012 | 0 | -0.111 | -0.001 |
| -0.107999999999997 | 0.988 | 0.012 | 0 | -0.107 | -0.001 |
| -0.103999999999997 | 0.989 | 0.011 | 0 | -0.103 | -0.001 |
| -0.0999999999999965 | 0.99 | 0.01 | 0 | -0.099 | -0.001 |
| -0.0959999999999965 | 0.991 | 0.009 | 0 | -0.095 | -0.001 |
| -0.0919999999999965 | 0.992 | 0.008 | 0 | -0.091 | -0.001 |
| -0.0879999999999965 | 0.992 | 0.008 | 0 | -0.087 | -0.001 |
| -0.0839999999999965 | 0.993 | 0.007 | 0 | -0.083 | -0.001 |
| -0.0799999999999965 | 0.994 | 0.006 | 0 | -0.079 | -0.001 |
| -0.0759999999999965 | 0.994 | 0.006 | 0 | -0.076 | 0 |
| -0.0719999999999965 | 0.995 | 0.005 | 0 | -0.072 | 0 |
| -0.0679999999999965 | 0.995 | 0.005 | 0 | -0.068 | 0 |
| -0.0639999999999965 | 0.996 | 0.004 | 0 | -0.064 | 0 |
| -0.0599999999999965 | 0.996 | 0.004 | 0 | -0.06 | 0 |
| -0.0559999999999965 | 0.997 | 0.003 | 0 | -0.056 | 0 |
| -0.0519999999999965 | 0.997 | 0.003 | 0 | -0.052 | 0 |
| -0.0479999999999965 | 0.998 | 0.002 | 0 | -0.048 | 0 |
| -0.0439999999999965 | 0.998 | 0.002 | 0 | -0.044 | 0 |
| -0.0399999999999965 | 0.998 | 0.002 | 0 | -0.04 | 0 |
| -0.0359999999999965 | 0.999 | 0.001 | 0 | -0.036 | 0 |
| -0.0319999999999965 | 0.999 | 0.001 | 0 | -0.032 | 0 |
| -0.0279999999999965 | 0.999 | 0.001 | 0 | -0.028 | 0 |
| -0.0239999999999965 | 0.999 | 0.001 | 0 | -0.024 | 0 |
| -0.0199999999999965 | 1 | 0 | 0 | -0.02 | 0 |
| -0.0159999999999965 | 1 | 0 | 0 | -0.016 | 0 |
| -0.0119999999999965 | 1 | 0 | 0 | -0.012 | 0 |
| -0.00799999999999647 | 1 | 0 | 0 | -0.008 | 0 |
| -0.00399999999999647 | 1 | 0 | 0 | -0.004 | 0 |
| 3.52495810318487e-15 | 1 | 0 | 0 | 0 | 0 |
| 0.00400000000000352 | 1 | 0 | 0 | 0.004 | 0 |
| 0.00800000000000352 | 1 | 0 | 0 | 0.008 | 0 |
| 0.0120000000000035 | 1 | 0 | 0 | 0.012 | 0 |
| 0.0160000000000035 | 1 | 0 | 0 | 0.016 | 0 |
| 0.0200000000000035 | 1 | 0 | 0 | 0.02 | 0 |
| 0.0240000000000035 | 0.999 | 0.001 | 0 | 0.024 | 0 |
| 0.0280000000000035 | 0.999 | 0.001 | 0 | 0.028 | 0 |
| 0.0320000000000035 | 0.999 | 0.001 | 0 | 0.032 | 0 |
| 0.0360000000000035 | 0.999 | 0.001 | 0 | 0.036 | 0 |
| 0.0400000000000035 | 0.998 | 0.002 | 0 | 0.04 | 0 |
| 0.0440000000000035 | 0.998 | 0.002 | 0 | 0.044 | 0 |
| 0.0480000000000035 | 0.998 | 0.002 | 0 | 0.048 | 0 |
| 0.0520000000000035 | 0.997 | 0.003 | 0 | 0.052 | 0 |
| 0.0560000000000035 | 0.997 | 0.003 | 0 | 0.056 | 0 |
| 0.0600000000000035 | 0.996 | 0.004 | 0 | 0.06 | 0 |
| 0.0640000000000035 | 0.996 | 0.004 | 0 | 0.064 | 0 |
| 0.0680000000000035 | 0.995 | 0.005 | 0 | 0.068 | 0 |
| 0.0720000000000036 | 0.995 | 0.005 | 0 | 0.072 | 0 |
| 0.0760000000000036 | 0.994 | 0.006 | 0 | 0.076 | 0 |
| 0.0800000000000036 | 0.994 | 0.006 | 0 | 0.079 | 0.001 |
| 0.0840000000000036 | 0.993 | 0.007 | 0 | 0.083 | 0.001 |
| 0.0880000000000036 | 0.992 | 0.008 | 0 | 0.087 | 0.001 |
| 0.0920000000000036 | 0.992 | 0.008 | 0 | 0.091 | 0.001 |
| 0.0960000000000036 | 0.991 | 0.009 | 0 | 0.095 | 0.001 |
| 0.100000000000004 | 0.99 | 0.01 | 0 | 0.099 | 0.001 |
| 0.104000000000004 | 0.989 | 0.011 | 0 | 0.103 | 0.001 |
| 0.108000000000004 | 0.988 | 0.012 | 0 | 0.107 | 0.001 |
| 0.112000000000004 | 0.988 | 0.012 | 0 | 0.111 | 0.001 |
| 0.116000000000004 | 0.987 | 0.013 | 0 | 0.114 | 0.002 |
| 0.120000000000004 | 0.986 | 0.014 | 0 | 0.118 | 0.002 |
| 0.124000000000004 | 0.985 | 0.015 | 0 | 0.122 | 0.002 |
| 0.128000000000004 | 0.984 | 0.016 | 0 | 0.126 | 0.002 |
| 0.132000000000004 | 0.983 | 0.017 | 0 | 0.13 | 0.002 |
| 0.136000000000004 | 0.982 | 0.018 | 0 | 0.134 | 0.002 |
| 0.140000000000004 | 0.981 | 0.019 | 0 | 0.137 | 0.003 |
| 0.144000000000004 | 0.979 | 0.02 | 0 | 0.141 | 0.003 |
| 0.148000000000004 | 0.978 | 0.021 | 0 | 0.145 | 0.003 |
| 0.152000000000004 | 0.977 | 0.023 | 0.001 | 0.149 | 0.003 |
| 0.156000000000004 | 0.976 | 0.024 | 0.001 | 0.152 | 0.004 |
| 0.160000000000004 | 0.975 | 0.025 | 0.001 | 0.156 | 0.004 |
| 0.164000000000004 | 0.973 | 0.026 | 0.001 | 0.16 | 0.004 |
| 0.168000000000004 | 0.972 | 0.027 | 0.001 | 0.163 | 0.005 |
| 0.172000000000004 | 0.971 | 0.029 | 0.001 | 0.167 | 0.005 |
| 0.176000000000004 | 0.969 | 0.03 | 0.001 | 0.171 | 0.005 |
| 0.180000000000004 | 0.968 | 0.031 | 0.001 | 0.174 | 0.006 |
| 0.184000000000004 | 0.967 | 0.033 | 0.001 | 0.178 | 0.006 |
| 0.188000000000004 | 0.965 | 0.034 | 0.001 | 0.181 | 0.006 |
| 0.192000000000004 | 0.964 | 0.036 | 0.001 | 0.185 | 0.007 |
| 0.196000000000004 | 0.962 | 0.037 | 0.001 | 0.189 | 0.007 |
| 0.200000000000004 | 0.961 | 0.038 | 0.002 | 0.192 | 0.008 |
| 0.204000000000004 | 0.959 | 0.04 | 0.002 | 0.196 | 0.008 |
| 0.208000000000004 | 0.958 | 0.041 | 0.002 | 0.199 | 0.009 |
| 0.212000000000004 | 0.956 | 0.043 | 0.002 | 0.203 | 0.009 |
| 0.216000000000004 | 0.954 | 0.045 | 0.002 | 0.206 | 0.01 |
| 0.220000000000004 | 0.953 | 0.046 | 0.002 | 0.21 | 0.01 |
| 0.224000000000004 | 0.951 | 0.048 | 0.002 | 0.213 | 0.011 |
| 0.228000000000004 | 0.949 | 0.049 | 0.003 | 0.216 | 0.011 |
| 0.232000000000004 | 0.948 | 0.051 | 0.003 | 0.22 | 0.012 |
| 0.236000000000004 | 0.946 | 0.053 | 0.003 | 0.223 | 0.012 |
| 0.240000000000004 | 0.944 | 0.054 | 0.003 | 0.227 | 0.013 |
| 0.244000000000004 | 0.942 | 0.056 | 0.003 | 0.23 | 0.014 |
| 0.248000000000004 | 0.94 | 0.058 | 0.004 | 0.233 | 0.014 |
| 0.252000000000004 | 0.938 | 0.06 | 0.004 | 0.236 | 0.015 |
| 0.256000000000004 | 0.937 | 0.061 | 0.004 | 0.24 | 0.016 |
| 0.260000000000004 | 0.935 | 0.063 | 0.004 | 0.243 | 0.016 |
| 0.264000000000004 | 0.933 | 0.065 | 0.005 | 0.246 | 0.017 |
| 0.268000000000004 | 0.931 | 0.067 | 0.005 | 0.249 | 0.018 |
| 0.272000000000004 | 0.929 | 0.069 | 0.005 | 0.253 | 0.019 |
| 0.276000000000004 | 0.927 | 0.071 | 0.005 | 0.256 | 0.019 |
| 0.280000000000004 | 0.925 | 0.072 | 0.006 | 0.259 | 0.02 |
| 0.284000000000004 | 0.923 | 0.074 | 0.006 | 0.262 | 0.021 |
| 0.288000000000004 | 0.92 | 0.076 | 0.006 | 0.265 | 0.022 |
| 0.292000000000004 | 0.918 | 0.078 | 0.007 | 0.268 | 0.023 |
| 0.296000000000004 | 0.916 | 0.08 | 0.007 | 0.271 | 0.024 |
| 0.300000000000004 | 0.914 | 0.082 | 0.007 | 0.274 | 0.025 |
| 0.304000000000004 | 0.912 | 0.084 | 0.008 | 0.277 | 0.026 |
| 0.308000000000004 | 0.909 | 0.086 | 0.008 | 0.28 | 0.027 |
| 0.312000000000004 | 0.907 | 0.088 | 0.009 | 0.283 | 0.028 |
| 0.316000000000004 | 0.905 | 0.09 | 0.009 | 0.286 | 0.029 |
| 0.320000000000004 | 0.903 | 0.092 | 0.009 | 0.289 | 0.03 |
| 0.324000000000004 | 0.9 | 0.095 | 0.01 | 0.292 | 0.031 |
| 0.328000000000004 | 0.898 | 0.097 | 0.01 | 0.295 | 0.032 |
| 0.332000000000004 | 0.896 | 0.099 | 0.011 | 0.297 | 0.033 |
| 0.336000000000004 | 0.893 | 0.101 | 0.011 | 0.3 | 0.034 |
| 0.340000000000004 | 0.891 | 0.103 | 0.012 | 0.303 | 0.035 |
| 0.344000000000004 | 0.888 | 0.105 | 0.012 | 0.306 | 0.036 |
| 0.348000000000004 | 0.886 | 0.107 | 0.013 | 0.308 | 0.037 |
| 0.352000000000004 | 0.883 | 0.109 | 0.014 | 0.311 | 0.039 |
| 0.356000000000004 | 0.881 | 0.112 | 0.014 | 0.314 | 0.04 |
| 0.360000000000004 | 0.878 | 0.114 | 0.015 | 0.316 | 0.041 |
| 0.364000000000004 | 0.876 | 0.116 | 0.015 | 0.319 | 0.042 |
| 0.368000000000004 | 0.873 | 0.118 | 0.016 | 0.321 | 0.044 |
| 0.372000000000004 | 0.871 | 0.12 | 0.017 | 0.324 | 0.045 |
| 0.376000000000004 | 0.868 | 0.123 | 0.017 | 0.326 | 0.046 |
| 0.380000000000004 | 0.866 | 0.125 | 0.018 | 0.329 | 0.047 |
| 0.384000000000004 | 0.863 | 0.127 | 0.019 | 0.331 | 0.049 |
| 0.388000000000004 | 0.86 | 0.13 | 0.019 | 0.334 | 0.05 |
| 0.392000000000004 | 0.858 | 0.132 | 0.02 | 0.336 | 0.052 |
| 0.396000000000004 | 0.855 | 0.134 | 0.021 | 0.339 | 0.053 |
| 0.400000000000004 | 0.852 | 0.136 | 0.022 | 0.341 | 0.055 |
| 0.404000000000004 | 0.849 | 0.139 | 0.023 | 0.343 | 0.056 |
| 0.408000000000004 | 0.847 | 0.141 | 0.023 | 0.345 | 0.058 |
| 0.412000000000004 | 0.844 | 0.143 | 0.024 | 0.348 | 0.059 |
| 0.416000000000004 | 0.841 | 0.146 | 0.025 | 0.35 | 0.061 |
| 0.420000000000004 | 0.838 | 0.148 | 0.026 | 0.352 | 0.062 |
| 0.424000000000004 | 0.835 | 0.15 | 0.027 | 0.354 | 0.064 |
| 0.428000000000004 | 0.833 | 0.153 | 0.028 | 0.356 | 0.065 |
| 0.432000000000004 | 0.83 | 0.155 | 0.029 | 0.358 | 0.067 |
| 0.436000000000004 | 0.827 | 0.157 | 0.03 | 0.361 | 0.069 |
| 0.440000000000004 | 0.824 | 0.16 | 0.031 | 0.363 | 0.07 |
| 0.444000000000004 | 0.821 | 0.162 | 0.032 | 0.365 | 0.072 |
| 0.448000000000004 | 0.818 | 0.164 | 0.033 | 0.367 | 0.074 |
| 0.452000000000004 | 0.815 | 0.167 | 0.034 | 0.368 | 0.075 |
| 0.456000000000004 | 0.812 | 0.169 | 0.035 | 0.37 | 0.077 |
| 0.460000000000004 | 0.809 | 0.171 | 0.036 | 0.372 | 0.079 |
| 0.464000000000004 | 0.806 | 0.174 | 0.037 | 0.374 | 0.081 |
| 0.468000000000004 | 0.803 | 0.176 | 0.039 | 0.376 | 0.082 |
| 0.472000000000004 | 0.8 | 0.178 | 0.04 | 0.378 | 0.084 |
| 0.476000000000004 | 0.797 | 0.181 | 0.041 | 0.379 | 0.086 |
| 0.480000000000004 | 0.794 | 0.183 | 0.042 | 0.381 | 0.088 |
| 0.484000000000004 | 0.791 | 0.185 | 0.043 | 0.383 | 0.09 |
| 0.488000000000004 | 0.788 | 0.188 | 0.045 | 0.385 | 0.092 |
| 0.492000000000004 | 0.785 | 0.19 | 0.046 | 0.386 | 0.093 |
| 0.496000000000004 | 0.782 | 0.192 | 0.047 | 0.388 | 0.095 |
| 0.500000000000004 | 0.779 | 0.195 | 0.049 | 0.389 | 0.097 |
| 0.504000000000004 | 0.776 | 0.197 | 0.05 | 0.391 | 0.099 |
| 0.508000000000004 | 0.773 | 0.199 | 0.051 | 0.392 | 0.101 |
| 0.512000000000004 | 0.769 | 0.202 | 0.053 | 0.394 | 0.103 |
| 0.516000000000004 | 0.766 | 0.204 | 0.054 | 0.395 | 0.105 |
| 0.520000000000004 | 0.763 | 0.206 | 0.056 | 0.397 | 0.107 |
| 0.524000000000004 | 0.76 | 0.209 | 0.057 | 0.398 | 0.109 |
| 0.528000000000004 | 0.757 | 0.211 | 0.059 | 0.4 | 0.111 |
| 0.532000000000004 | 0.754 | 0.213 | 0.06 | 0.401 | 0.113 |
| 0.536000000000004 | 0.75 | 0.216 | 0.062 | 0.402 | 0.116 |
| 0.540000000000004 | 0.747 | 0.218 | 0.064 | 0.403 | 0.118 |
| 0.544000000000004 | 0.744 | 0.22 | 0.065 | 0.405 | 0.12 |
| 0.548000000000004 | 0.741 | 0.222 | 0.067 | 0.406 | 0.122 |
| 0.552000000000004 | 0.737 | 0.225 | 0.068 | 0.407 | 0.124 |
| 0.556000000000004 | 0.734 | 0.227 | 0.07 | 0.408 | 0.126 |
| 0.560000000000004 | 0.731 | 0.229 | 0.072 | 0.409 | 0.128 |
| 0.564000000000004 | 0.728 | 0.231 | 0.074 | 0.41 | 0.131 |
| 0.568000000000004 | 0.724 | 0.234 | 0.075 | 0.411 | 0.133 |
| 0.572000000000004 | 0.721 | 0.236 | 0.077 | 0.412 | 0.135 |
| 0.576000000000004 | 0.718 | 0.238 | 0.079 | 0.413 | 0.137 |
| 0.580000000000004 | 0.714 | 0.24 | 0.081 | 0.414 | 0.139 |
| 0.584000000000004 | 0.711 | 0.242 | 0.083 | 0.415 | 0.142 |
| 0.588000000000004 | 0.708 | 0.245 | 0.085 | 0.416 | 0.144 |
| 0.592000000000004 | 0.704 | 0.247 | 0.087 | 0.417 | 0.146 |
| 0.596000000000004 | 0.701 | 0.249 | 0.088 | 0.418 | 0.148 |
| 0.600000000000004 | 0.698 | 0.251 | 0.09 | 0.419 | 0.151 |
| 0.604000000000004 | 0.694 | 0.253 | 0.092 | 0.419 | 0.153 |
| 0.608000000000004 | 0.691 | 0.255 | 0.094 | 0.42 | 0.155 |
| 0.612000000000004 | 0.688 | 0.258 | 0.096 | 0.421 | 0.158 |
| 0.616000000000004 | 0.684 | 0.26 | 0.099 | 0.421 | 0.16 |
| 0.620000000000004 | 0.681 | 0.262 | 0.101 | 0.422 | 0.162 |
| 0.624000000000004 | 0.677 | 0.264 | 0.103 | 0.423 | 0.165 |
| 0.628000000000004 | 0.674 | 0.266 | 0.105 | 0.423 | 0.167 |
| 0.632000000000004 | 0.671 | 0.268 | 0.107 | 0.424 | 0.169 |
| 0.636000000000004 | 0.667 | 0.27 | 0.109 | 0.424 | 0.172 |
| 0.640000000000004 | 0.664 | 0.272 | 0.111 | 0.425 | 0.174 |
| 0.644000000000004 | 0.661 | 0.274 | 0.114 | 0.425 | 0.176 |
| 0.648000000000004 | 0.657 | 0.276 | 0.116 | 0.426 | 0.179 |
| 0.652000000000004 | 0.654 | 0.278 | 0.118 | 0.426 | 0.181 |
| 0.656000000000004 | 0.65 | 0.28 | 0.12 | 0.427 | 0.184 |
| 0.660000000000004 | 0.647 | 0.282 | 0.123 | 0.427 | 0.186 |
| 0.664000000000004 | 0.643 | 0.284 | 0.125 | 0.427 | 0.188 |
| 0.668000000000004 | 0.64 | 0.286 | 0.127 | 0.428 | 0.191 |
| 0.672000000000004 | 0.637 | 0.287 | 0.13 | 0.428 | 0.193 |
| 0.676000000000004 | 0.633 | 0.289 | 0.132 | 0.428 | 0.196 |
| 0.680000000000004 | 0.63 | 0.291 | 0.135 | 0.428 | 0.198 |
| 0.684000000000004 | 0.626 | 0.293 | 0.137 | 0.428 | 0.2 |
| 0.688000000000004 | 0.623 | 0.295 | 0.14 | 0.429 | 0.203 |
| 0.692000000000004 | 0.619 | 0.297 | 0.142 | 0.429 | 0.205 |
| 0.696000000000004 | 0.616 | 0.298 | 0.145 | 0.429 | 0.208 |
| 0.700000000000004 | 0.613 | 0.3 | 0.147 | 0.429 | 0.21 |
| 0.704000000000004 | 0.609 | 0.302 | 0.15 | 0.429 | 0.213 |
| 0.708000000000004 | 0.606 | 0.304 | 0.152 | 0.429 | 0.215 |
| 0.712000000000004 | 0.602 | 0.305 | 0.155 | 0.429 | 0.217 |
| 0.716000000000004 | 0.599 | 0.307 | 0.157 | 0.429 | 0.22 |
| 0.720000000000004 | 0.595 | 0.309 | 0.16 | 0.429 | 0.222 |
| 0.724000000000004 | 0.592 | 0.31 | 0.163 | 0.429 | 0.225 |
| 0.728000000000004 | 0.589 | 0.312 | 0.165 | 0.429 | 0.227 |
| 0.732000000000004 | 0.585 | 0.314 | 0.168 | 0.428 | 0.23 |
| 0.736000000000004 | 0.582 | 0.315 | 0.171 | 0.428 | 0.232 |
| 0.740000000000004 | 0.578 | 0.317 | 0.173 | 0.428 | 0.234 |
| 0.744000000000004 | 0.575 | 0.318 | 0.176 | 0.428 | 0.237 |
| 0.748000000000004 | 0.571 | 0.32 | 0.179 | 0.427 | 0.239 |
| 0.752000000000004 | 0.568 | 0.321 | 0.182 | 0.427 | 0.242 |
| 0.756000000000004 | 0.565 | 0.323 | 0.184 | 0.427 | 0.244 |
| 0.760000000000004 | 0.561 | 0.324 | 0.187 | 0.427 | 0.246 |
| 0.764000000000004 | 0.558 | 0.326 | 0.19 | 0.426 | 0.249 |
| 0.768000000000004 | 0.554 | 0.327 | 0.193 | 0.426 | 0.251 |
| 0.772000000000004 | 0.551 | 0.328 | 0.196 | 0.425 | 0.254 |
| 0.776000000000004 | 0.548 | 0.33 | 0.199 | 0.425 | 0.256 |
| 0.780000000000004 | 0.544 | 0.331 | 0.201 | 0.424 | 0.258 |
| 0.784000000000004 | 0.541 | 0.332 | 0.204 | 0.424 | 0.261 |
| 0.788000000000004 | 0.537 | 0.334 | 0.207 | 0.424 | 0.263 |
| 0.792000000000004 | 0.534 | 0.335 | 0.21 | 0.423 | 0.265 |
| 0.796000000000004 | 0.531 | 0.336 | 0.213 | 0.422 | 0.268 |
| 0.800000000000004 | 0.527 | 0.337 | 0.216 | 0.422 | 0.27 |
| 0.804000000000004 | 0.524 | 0.339 | 0.219 | 0.421 | 0.272 |
| 0.808000000000004 | 0.521 | 0.34 | 0.222 | 0.421 | 0.275 |
| 0.812000000000004 | 0.517 | 0.341 | 0.225 | 0.42 | 0.277 |
| 0.816000000000004 | 0.514 | 0.342 | 0.228 | 0.419 | 0.279 |
| 0.820000000000004 | 0.51 | 0.343 | 0.231 | 0.419 | 0.281 |
| 0.824000000000004 | 0.507 | 0.344 | 0.234 | 0.418 | 0.284 |
| 0.828000000000004 | 0.504 | 0.345 | 0.237 | 0.417 | 0.286 |
| 0.832000000000004 | 0.5 | 0.346 | 0.24 | 0.416 | 0.288 |
| 0.836000000000004 | 0.497 | 0.347 | 0.243 | 0.416 | 0.29 |
| 0.840000000000004 | 0.494 | 0.348 | 0.246 | 0.415 | 0.293 |
| 0.844000000000004 | 0.49 | 0.349 | 0.249 | 0.414 | 0.295 |
| 0.848000000000004 | 0.487 | 0.35 | 0.252 | 0.413 | 0.297 |
| 0.852000000000004 | 0.484 | 0.351 | 0.255 | 0.412 | 0.299 |
| 0.856000000000004 | 0.481 | 0.352 | 0.258 | 0.411 | 0.301 |
| 0.860000000000004 | 0.477 | 0.353 | 0.261 | 0.41 | 0.304 |
| 0.864000000000004 | 0.474 | 0.354 | 0.264 | 0.41 | 0.306 |
| 0.868000000000004 | 0.471 | 0.355 | 0.267 | 0.409 | 0.308 |
| 0.872000000000004 | 0.467 | 0.355 | 0.27 | 0.408 | 0.31 |
| 0.876000000000004 | 0.464 | 0.356 | 0.273 | 0.407 | 0.312 |
| 0.880000000000004 | 0.461 | 0.357 | 0.276 | 0.406 | 0.314 |
| 0.884000000000004 | 0.458 | 0.358 | 0.28 | 0.405 | 0.316 |
| 0.888000000000004 | 0.455 | 0.358 | 0.283 | 0.404 | 0.318 |
| 0.892000000000004 | 0.451 | 0.359 | 0.286 | 0.403 | 0.32 |
| 0.896000000000004 | 0.448 | 0.36 | 0.289 | 0.401 | 0.322 |
| 0.900000000000004 | 0.445 | 0.36 | 0.292 | 0.4 | 0.324 |
| 0.904000000000004 | 0.442 | 0.361 | 0.295 | 0.399 | 0.326 |
| 0.908000000000004 | 0.438 | 0.362 | 0.298 | 0.398 | 0.328 |
| 0.912000000000004 | 0.435 | 0.362 | 0.301 | 0.397 | 0.33 |
| 0.916000000000004 | 0.432 | 0.363 | 0.304 | 0.396 | 0.332 |
| 0.920000000000004 | 0.429 | 0.363 | 0.307 | 0.395 | 0.334 |
| 0.924000000000004 | 0.426 | 0.364 | 0.31 | 0.393 | 0.336 |
| 0.928000000000004 | 0.423 | 0.364 | 0.313 | 0.392 | 0.338 |
| 0.932000000000004 | 0.42 | 0.364 | 0.317 | 0.391 | 0.34 |
| 0.936000000000004 | 0.416 | 0.365 | 0.32 | 0.39 | 0.341 |
| 0.940000000000004 | 0.413 | 0.365 | 0.323 | 0.388 | 0.343 |
| 0.944000000000004 | 0.41 | 0.366 | 0.326 | 0.387 | 0.345 |
| 0.948000000000004 | 0.407 | 0.366 | 0.329 | 0.386 | 0.347 |
| 0.952000000000004 | 0.404 | 0.366 | 0.332 | 0.385 | 0.349 |
| 0.956000000000004 | 0.401 | 0.366 | 0.335 | 0.383 | 0.35 |
| 0.960000000000004 | 0.398 | 0.367 | 0.338 | 0.382 | 0.352 |
| 0.964000000000004 | 0.395 | 0.367 | 0.341 | 0.381 | 0.354 |
| 0.968000000000004 | 0.392 | 0.367 | 0.344 | 0.379 | 0.355 |
| 0.972000000000004 | 0.389 | 0.367 | 0.347 | 0.378 | 0.357 |
| 0.976000000000004 | 0.386 | 0.367 | 0.35 | 0.376 | 0.359 |
| 0.980000000000004 | 0.383 | 0.368 | 0.353 | 0.375 | 0.36 |
| 0.984000000000004 | 0.38 | 0.368 | 0.356 | 0.374 | 0.362 |
| 0.988000000000004 | 0.377 | 0.368 | 0.359 | 0.372 | 0.363 |
| 0.992000000000004 | 0.374 | 0.368 | 0.362 | 0.371 | 0.365 |
| 0.996000000000004 | 0.371 | 0.368 | 0.365 | 0.369 | 0.366 |
| 1.000000000000004 | 0.368 | 0.368 | 0.368 | 0.368 | 0.368 |
| 1.004000000000004 | 0.365 | 0.368 | 0.371 | 0.366 | 0.369 |
| 1.008000000000004 | 0.362 | 0.368 | 0.374 | 0.365 | 0.371 |
| 1.012000000000004 | 0.359 | 0.368 | 0.377 | 0.363 | 0.372 |
| 1.016000000000004 | 0.356 | 0.368 | 0.38 | 0.362 | 0.374 |
| 1.020000000000004 | 0.353 | 0.368 | 0.382 | 0.36 | 0.375 |
| 1.024000000000004 | 0.35 | 0.367 | 0.385 | 0.359 | 0.376 |
| 1.028000000000004 | 0.348 | 0.367 | 0.388 | 0.357 | 0.378 |
| 1.032000000000004 | 0.345 | 0.367 | 0.391 | 0.356 | 0.379 |
| 1.036000000000004 | 0.342 | 0.367 | 0.394 | 0.354 | 0.38 |
| 1.040000000000004 | 0.339 | 0.367 | 0.397 | 0.353 | 0.381 |
| 1.044000000000004 | 0.336 | 0.366 | 0.399 | 0.351 | 0.383 |
| 1.048000000000004 | 0.333 | 0.366 | 0.402 | 0.349 | 0.384 |
| 1.052000000000004 | 0.331 | 0.366 | 0.405 | 0.348 | 0.385 |
| 1.056000000000004 | 0.328 | 0.366 | 0.408 | 0.346 | 0.386 |
| 1.060000000000004 | 0.325 | 0.365 | 0.41 | 0.345 | 0.387 |
| 1.064000000000004 | 0.322 | 0.365 | 0.413 | 0.343 | 0.388 |
| 1.068000000000004 | 0.32 | 0.365 | 0.416 | 0.341 | 0.389 |
| 1.072000000000004 | 0.317 | 0.364 | 0.418 | 0.34 | 0.39 |
| 1.076000000000004 | 0.314 | 0.364 | 0.421 | 0.338 | 0.391 |
| 1.080000000000004 | 0.311 | 0.363 | 0.424 | 0.336 | 0.392 |
| 1.084000000000004 | 0.309 | 0.363 | 0.426 | 0.335 | 0.393 |
| 1.088000000000004 | 0.306 | 0.362 | 0.429 | 0.333 | 0.394 |
| 1.092000000000004 | 0.303 | 0.362 | 0.432 | 0.331 | 0.395 |
| 1.096000000000004 | 0.301 | 0.361 | 0.434 | 0.33 | 0.396 |
| 1.100000000000004 | 0.298 | 0.361 | 0.437 | 0.328 | 0.397 |
| 1.104000000000004 | 0.296 | 0.36 | 0.439 | 0.326 | 0.398 |
| 1.108000000000004 | 0.293 | 0.36 | 0.442 | 0.325 | 0.399 |
| 1.112000000000004 | 0.29 | 0.359 | 0.444 | 0.323 | 0.399 |
| 1.116000000000004 | 0.288 | 0.358 | 0.446 | 0.321 | 0.4 |
| 1.120000000000004 | 0.285 | 0.358 | 0.449 | 0.319 | 0.401 |
| 1.124000000000004 | 0.283 | 0.357 | 0.451 | 0.318 | 0.401 |
| 1.128000000000004 | 0.28 | 0.356 | 0.454 | 0.316 | 0.402 |
| 1.132000000000004 | 0.278 | 0.356 | 0.456 | 0.314 | 0.403 |
| 1.136000000000004 | 0.275 | 0.355 | 0.458 | 0.313 | 0.403 |
| 1.140000000000004 | 0.273 | 0.354 | 0.46 | 0.311 | 0.404 |
| 1.144000000000004 | 0.27 | 0.354 | 0.463 | 0.309 | 0.404 |
| 1.148000000000004 | 0.268 | 0.353 | 0.465 | 0.307 | 0.405 |
| 1.152000000000004 | 0.265 | 0.352 | 0.467 | 0.306 | 0.406 |
| 1.156000000000004 | 0.263 | 0.351 | 0.469 | 0.304 | 0.406 |
| 1.160000000000004 | 0.26 | 0.35 | 0.471 | 0.302 | 0.406 |
| 1.164000000000004 | 0.258 | 0.35 | 0.474 | 0.3 | 0.407 |
| 1.168000000000004 | 0.256 | 0.349 | 0.476 | 0.299 | 0.407 |
| 1.172000000000004 | 0.253 | 0.348 | 0.478 | 0.297 | 0.408 |
| 1.176000000000004 | 0.251 | 0.347 | 0.48 | 0.295 | 0.408 |
| 1.180000000000004 | 0.248 | 0.346 | 0.482 | 0.293 | 0.408 |
| 1.184000000000004 | 0.246 | 0.345 | 0.484 | 0.291 | 0.409 |
| 1.188000000000004 | 0.244 | 0.344 | 0.486 | 0.29 | 0.409 |
| 1.192000000000004 | 0.242 | 0.343 | 0.488 | 0.288 | 0.409 |
| 1.196000000000004 | 0.239 | 0.342 | 0.489 | 0.286 | 0.409 |
| 1.200000000000004 | 0.237 | 0.341 | 0.491 | 0.284 | 0.409 |
| 1.204000000000004 | 0.235 | 0.34 | 0.493 | 0.283 | 0.41 |
| 1.208000000000004 | 0.232 | 0.339 | 0.495 | 0.281 | 0.41 |
| 1.212000000000004 | 0.23 | 0.338 | 0.497 | 0.279 | 0.41 |
| 1.216000000000004 | 0.228 | 0.337 | 0.498 | 0.277 | 0.41 |
| 1.220000000000004 | 0.226 | 0.336 | 0.5 | 0.275 | 0.41 |
| 1.224000000000004 | 0.224 | 0.335 | 0.502 | 0.274 | 0.41 |
| 1.228000000000004 | 0.221 | 0.334 | 0.503 | 0.272 | 0.41 |
| 1.232000000000004 | 0.219 | 0.333 | 0.505 | 0.27 | 0.41 |
| 1.236000000000004 | 0.217 | 0.332 | 0.507 | 0.268 | 0.41 |
| 1.240000000000004 | 0.215 | 0.33 | 0.508 | 0.266 | 0.41 |
| 1.244000000000004 | 0.213 | 0.329 | 0.51 | 0.265 | 0.41 |
| 1.248000000000004 | 0.211 | 0.328 | 0.511 | 0.263 | 0.409 |
| 1.252000000000004 | 0.209 | 0.327 | 0.512 | 0.261 | 0.409 |
| 1.256000000000004 | 0.206 | 0.326 | 0.514 | 0.259 | 0.409 |
| 1.260000000000004 | 0.204 | 0.325 | 0.515 | 0.258 | 0.409 |
| 1.264000000000004 | 0.202 | 0.323 | 0.517 | 0.256 | 0.409 |
| 1.268000000000004 | 0.2 | 0.322 | 0.518 | 0.254 | 0.408 |
| 1.272000000000004 | 0.198 | 0.321 | 0.519 | 0.252 | 0.408 |
| 1.276000000000004 | 0.196 | 0.32 | 0.52 | 0.25 | 0.408 |
| 1.280000000000004 | 0.194 | 0.318 | 0.522 | 0.249 | 0.407 |
| 1.284000000000004 | 0.192 | 0.317 | 0.523 | 0.247 | 0.407 |
| 1.288000000000004 | 0.19 | 0.316 | 0.524 | 0.245 | 0.407 |
| 1.292000000000004 | 0.188 | 0.314 | 0.525 | 0.243 | 0.406 |
| 1.296000000000004 | 0.186 | 0.313 | 0.526 | 0.242 | 0.406 |
| 1.300000000000004 | 0.185 | 0.312 | 0.527 | 0.24 | 0.405 |
| 1.304000000000004 | 0.183 | 0.311 | 0.528 | 0.238 | 0.405 |
| 1.308000000000004 | 0.181 | 0.309 | 0.529 | 0.236 | 0.404 |
| 1.312000000000004 | 0.179 | 0.308 | 0.53 | 0.235 | 0.404 |
| 1.316000000000004 | 0.177 | 0.306 | 0.531 | 0.233 | 0.403 |
| 1.320000000000004 | 0.175 | 0.305 | 0.532 | 0.231 | 0.403 |
| 1.324000000000004 | 0.173 | 0.304 | 0.532 | 0.229 | 0.402 |
| 1.328000000000004 | 0.171 | 0.302 | 0.533 | 0.228 | 0.401 |
| 1.332000000000004 | 0.17 | 0.301 | 0.534 | 0.226 | 0.401 |
| 1.336000000000004 | 0.168 | 0.3 | 0.535 | 0.224 | 0.4 |
| 1.340000000000004 | 0.166 | 0.298 | 0.535 | 0.222 | 0.399 |
| 1.344000000000004 | 0.164 | 0.297 | 0.536 | 0.221 | 0.399 |
| 1.348000000000004 | 0.162 | 0.295 | 0.537 | 0.219 | 0.398 |
| 1.352000000000004 | 0.161 | 0.294 | 0.537 | 0.217 | 0.397 |
| 1.356000000000004 | 0.159 | 0.292 | 0.538 | 0.216 | 0.396 |
| 1.360000000000004 | 0.157 | 0.291 | 0.538 | 0.214 | 0.396 |
| 1.364000000000004 | 0.156 | 0.289 | 0.539 | 0.212 | 0.395 |
| 1.368000000000004 | 0.154 | 0.288 | 0.539 | 0.211 | 0.394 |
| 1.372000000000004 | 0.152 | 0.287 | 0.539 | 0.209 | 0.393 |
| 1.376000000000004 | 0.151 | 0.285 | 0.54 | 0.207 | 0.392 |
| 1.380000000000004 | 0.149 | 0.284 | 0.54 | 0.205 | 0.391 |
| 1.384000000000004 | 0.147 | 0.282 | 0.54 | 0.204 | 0.39 |
| 1.388000000000005 | 0.146 | 0.281 | 0.541 | 0.202 | 0.389 |
| 1.392000000000004 | 0.144 | 0.279 | 0.541 | 0.201 | 0.389 |
| 1.396000000000004 | 0.142 | 0.278 | 0.541 | 0.199 | 0.388 |
| 1.400000000000005 | 0.141 | 0.276 | 0.541 | 0.197 | 0.387 |
| 1.404000000000005 | 0.139 | 0.275 | 0.541 | 0.196 | 0.385 |
| 1.408000000000005 | 0.138 | 0.273 | 0.541 | 0.194 | 0.384 |
| 1.412000000000005 | 0.136 | 0.272 | 0.541 | 0.192 | 0.383 |
| 1.416000000000005 | 0.135 | 0.27 | 0.541 | 0.191 | 0.382 |
| 1.420000000000005 | 0.133 | 0.268 | 0.541 | 0.189 | 0.381 |
| 1.424000000000005 | 0.132 | 0.267 | 0.541 | 0.187 | 0.38 |
| 1.428000000000005 | 0.13 | 0.265 | 0.541 | 0.186 | 0.379 |
| 1.432000000000005 | 0.129 | 0.264 | 0.541 | 0.184 | 0.378 |
| 1.436000000000005 | 0.127 | 0.262 | 0.541 | 0.183 | 0.377 |
| 1.440000000000005 | 0.126 | 0.261 | 0.541 | 0.181 | 0.375 |
| 1.444000000000005 | 0.124 | 0.259 | 0.54 | 0.179 | 0.374 |
| 1.448000000000005 | 0.123 | 0.258 | 0.54 | 0.178 | 0.373 |
| 1.452000000000005 | 0.121 | 0.256 | 0.54 | 0.176 | 0.372 |
| 1.456000000000005 | 0.12 | 0.254 | 0.539 | 0.175 | 0.371 |
| 1.460000000000005 | 0.119 | 0.253 | 0.539 | 0.173 | 0.369 |
| 1.464000000000005 | 0.117 | 0.251 | 0.539 | 0.172 | 0.368 |
| 1.468000000000005 | 0.116 | 0.25 | 0.538 | 0.17 | 0.367 |
| 1.472000000000005 | 0.115 | 0.248 | 0.538 | 0.169 | 0.365 |
| 1.476000000000005 | 0.113 | 0.247 | 0.537 | 0.167 | 0.364 |
| 1.480000000000005 | 0.112 | 0.245 | 0.537 | 0.166 | 0.363 |
| 1.484000000000005 | 0.111 | 0.243 | 0.536 | 0.164 | 0.361 |
| 1.488000000000005 | 0.109 | 0.242 | 0.536 | 0.163 | 0.36 |
| 1.492000000000005 | 0.108 | 0.24 | 0.535 | 0.161 | 0.359 |
| 1.496000000000005 | 0.107 | 0.239 | 0.534 | 0.16 | 0.357 |
| 1.500000000000005 | 0.105 | 0.237 | 0.534 | 0.158 | 0.356 |
| 1.504000000000005 | 0.104 | 0.236 | 0.533 | 0.157 | 0.354 |
| 1.508000000000005 | 0.103 | 0.234 | 0.532 | 0.155 | 0.353 |
| 1.512000000000005 | 0.102 | 0.232 | 0.531 | 0.154 | 0.351 |
| 1.516000000000005 | 0.1 | 0.231 | 0.53 | 0.152 | 0.35 |
| 1.520000000000005 | 0.099 | 0.229 | 0.53 | 0.151 | 0.348 |
| 1.524000000000005 | 0.098 | 0.228 | 0.529 | 0.149 | 0.347 |
| 1.528000000000005 | 0.097 | 0.226 | 0.528 | 0.148 | 0.345 |
| 1.532000000000005 | 0.096 | 0.225 | 0.527 | 0.147 | 0.344 |
| 1.536000000000005 | 0.094 | 0.223 | 0.526 | 0.145 | 0.342 |
| 1.540000000000005 | 0.093 | 0.221 | 0.525 | 0.144 | 0.341 |
| 1.544000000000005 | 0.092 | 0.22 | 0.524 | 0.142 | 0.339 |
| 1.548000000000005 | 0.091 | 0.218 | 0.523 | 0.141 | 0.338 |
| 1.552000000000005 | 0.09 | 0.217 | 0.522 | 0.14 | 0.336 |
| 1.556000000000005 | 0.089 | 0.215 | 0.521 | 0.138 | 0.335 |
| 1.560000000000005 | 0.088 | 0.213 | 0.52 | 0.137 | 0.333 |
| 1.564000000000005 | 0.087 | 0.212 | 0.518 | 0.135 | 0.331 |
| 1.568000000000005 | 0.086 | 0.21 | 0.517 | 0.134 | 0.33 |
| 1.572000000000005 | 0.084 | 0.209 | 0.516 | 0.133 | 0.328 |
| 1.576000000000005 | 0.083 | 0.207 | 0.515 | 0.131 | 0.327 |
| 1.580000000000005 | 0.082 | 0.206 | 0.513 | 0.13 | 0.325 |
| 1.584000000000005 | 0.081 | 0.204 | 0.512 | 0.129 | 0.323 |
| 1.588000000000005 | 0.08 | 0.203 | 0.511 | 0.128 | 0.322 |
| 1.592000000000005 | 0.079 | 0.201 | 0.509 | 0.126 | 0.32 |
| 1.596000000000005 | 0.078 | 0.199 | 0.508 | 0.125 | 0.318 |
| 1.600000000000005 | 0.077 | 0.198 | 0.507 | 0.124 | 0.317 |
| 1.604000000000005 | 0.076 | 0.196 | 0.505 | 0.122 | 0.315 |
| 1.608000000000005 | 0.075 | 0.195 | 0.504 | 0.121 | 0.313 |
| 1.612000000000005 | 0.074 | 0.193 | 0.502 | 0.12 | 0.312 |
| 1.616000000000005 | 0.073 | 0.192 | 0.501 | 0.119 | 0.31 |
| 1.620000000000005 | 0.072 | 0.19 | 0.499 | 0.117 | 0.308 |
| 1.624000000000005 | 0.072 | 0.189 | 0.498 | 0.116 | 0.306 |
| 1.628000000000005 | 0.071 | 0.187 | 0.496 | 0.115 | 0.305 |
| 1.632000000000005 | 0.07 | 0.186 | 0.495 | 0.114 | 0.303 |
| 1.636000000000005 | 0.069 | 0.184 | 0.493 | 0.113 | 0.301 |
| 1.640000000000005 | 0.068 | 0.183 | 0.491 | 0.111 | 0.3 |
| 1.644000000000005 | 0.067 | 0.181 | 0.49 | 0.11 | 0.298 |
| 1.648000000000005 | 0.066 | 0.18 | 0.488 | 0.109 | 0.296 |
| 1.652000000000005 | 0.065 | 0.178 | 0.486 | 0.108 | 0.294 |
| 1.656000000000005 | 0.064 | 0.177 | 0.484 | 0.107 | 0.293 |
| 1.660000000000005 | 0.064 | 0.175 | 0.483 | 0.106 | 0.291 |
| 1.664000000000005 | 0.063 | 0.174 | 0.481 | 0.104 | 0.289 |
| 1.668000000000005 | 0.062 | 0.172 | 0.479 | 0.103 | 0.287 |
| 1.672000000000005 | 0.061 | 0.171 | 0.477 | 0.102 | 0.285 |
| 1.676000000000005 | 0.06 | 0.169 | 0.476 | 0.101 | 0.284 |
| 1.680000000000005 | 0.059 | 0.168 | 0.474 | 0.1 | 0.282 |
| 1.684000000000005 | 0.059 | 0.166 | 0.472 | 0.099 | 0.28 |
| 1.688000000000005 | 0.058 | 0.165 | 0.47 | 0.098 | 0.278 |
| 1.692000000000005 | 0.057 | 0.163 | 0.468 | 0.097 | 0.277 |
| 1.696000000000005 | 0.056 | 0.162 | 0.466 | 0.096 | 0.275 |
| 1.700000000000005 | 0.056 | 0.161 | 0.464 | 0.094 | 0.273 |
| 1.704000000000005 | 0.055 | 0.159 | 0.462 | 0.093 | 0.271 |
| 1.708000000000005 | 0.054 | 0.158 | 0.46 | 0.092 | 0.269 |
| 1.712000000000005 | 0.053 | 0.156 | 0.458 | 0.091 | 0.268 |
| 1.716000000000005 | 0.053 | 0.155 | 0.456 | 0.09 | 0.266 |
| 1.720000000000005 | 0.052 | 0.154 | 0.454 | 0.089 | 0.264 |
| 1.724000000000005 | 0.051 | 0.152 | 0.452 | 0.088 | 0.262 |
| 1.728000000000005 | 0.05 | 0.151 | 0.45 | 0.087 | 0.261 |
| 1.732000000000005 | 0.05 | 0.149 | 0.448 | 0.086 | 0.259 |
| 1.736000000000005 | 0.049 | 0.148 | 0.446 | 0.085 | 0.257 |
| 1.740000000000005 | 0.048 | 0.147 | 0.444 | 0.084 | 0.255 |
| 1.744000000000005 | 0.048 | 0.145 | 0.442 | 0.083 | 0.253 |
| 1.748000000000005 | 0.047 | 0.144 | 0.44 | 0.082 | 0.252 |
| 1.752000000000005 | 0.046 | 0.143 | 0.438 | 0.081 | 0.25 |
| 1.756000000000005 | 0.046 | 0.141 | 0.435 | 0.08 | 0.248 |
| 1.760000000000005 | 0.045 | 0.14 | 0.433 | 0.079 | 0.246 |
| 1.764000000000005 | 0.045 | 0.139 | 0.431 | 0.079 | 0.244 |
| 1.768000000000005 | 0.044 | 0.137 | 0.429 | 0.078 | 0.243 |
| 1.772000000000005 | 0.043 | 0.136 | 0.427 | 0.077 | 0.241 |
| 1.776000000000005 | 0.043 | 0.135 | 0.425 | 0.076 | 0.239 |
| 1.780000000000005 | 0.042 | 0.133 | 0.422 | 0.075 | 0.237 |
| 1.784000000000005 | 0.041 | 0.132 | 0.42 | 0.074 | 0.235 |
| 1.788000000000005 | 0.041 | 0.131 | 0.418 | 0.073 | 0.234 |
| 1.792000000000005 | 0.04 | 0.129 | 0.416 | 0.072 | 0.232 |
| 1.796000000000005 | 0.04 | 0.128 | 0.413 | 0.071 | 0.23 |
| 1.800000000000005 | 0.039 | 0.127 | 0.411 | 0.07 | 0.228 |
| 1.804000000000005 | 0.039 | 0.126 | 0.409 | 0.07 | 0.227 |
| 1.808000000000005 | 0.038 | 0.124 | 0.407 | 0.069 | 0.225 |
| 1.812000000000005 | 0.038 | 0.123 | 0.404 | 0.068 | 0.223 |
| 1.816000000000005 | 0.037 | 0.122 | 0.402 | 0.067 | 0.221 |
| 1.820000000000005 | 0.036 | 0.121 | 0.4 | 0.066 | 0.22 |
| 1.824000000000005 | 0.036 | 0.119 | 0.397 | 0.065 | 0.218 |
| 1.828000000000005 | 0.035 | 0.118 | 0.395 | 0.065 | 0.216 |
| 1.832000000000005 | 0.035 | 0.117 | 0.393 | 0.064 | 0.214 |
| 1.836000000000005 | 0.034 | 0.116 | 0.39 | 0.063 | 0.213 |
| 1.840000000000005 | 0.034 | 0.115 | 0.388 | 0.062 | 0.211 |
| 1.844000000000005 | 0.033 | 0.113 | 0.386 | 0.062 | 0.209 |
| 1.848000000000005 | 0.033 | 0.112 | 0.383 | 0.061 | 0.207 |
| 1.852000000000005 | 0.032 | 0.111 | 0.381 | 0.06 | 0.206 |
| 1.856000000000005 | 0.032 | 0.11 | 0.379 | 0.059 | 0.204 |
| 1.860000000000005 | 0.031 | 0.109 | 0.376 | 0.058 | 0.202 |
| 1.864000000000005 | 0.031 | 0.108 | 0.374 | 0.058 | 0.201 |
| 1.868000000000005 | 0.031 | 0.106 | 0.372 | 0.057 | 0.199 |
| 1.872000000000005 | 0.03 | 0.105 | 0.369 | 0.056 | 0.197 |
| 1.876000000000005 | 0.03 | 0.104 | 0.367 | 0.056 | 0.196 |
| 1.880000000000005 | 0.029 | 0.103 | 0.364 | 0.055 | 0.194 |
| 1.884000000000005 | 0.029 | 0.102 | 0.362 | 0.054 | 0.192 |
| 1.888000000000005 | 0.028 | 0.101 | 0.36 | 0.053 | 0.191 |
| 1.892000000000005 | 0.028 | 0.1 | 0.357 | 0.053 | 0.189 |
| 1.896000000000005 | 0.027 | 0.099 | 0.355 | 0.052 | 0.187 |
| 1.900000000000005 | 0.027 | 0.098 | 0.353 | 0.051 | 0.186 |
| 1.904000000000005 | 0.027 | 0.097 | 0.35 | 0.051 | 0.184 |
| 1.908000000000005 | 0.026 | 0.096 | 0.348 | 0.05 | 0.182 |
| 1.912000000000005 | 0.026 | 0.094 | 0.345 | 0.049 | 0.181 |
| 1.916000000000005 | 0.025 | 0.093 | 0.343 | 0.049 | 0.179 |
| 1.920000000000005 | 0.025 | 0.092 | 0.341 | 0.048 | 0.177 |
| 1.924000000000005 | 0.025 | 0.091 | 0.338 | 0.047 | 0.176 |
| 1.928000000000005 | 0.024 | 0.09 | 0.336 | 0.047 | 0.174 |
| 1.932000000000005 | 0.024 | 0.089 | 0.333 | 0.046 | 0.173 |
| 1.936000000000005 | 0.024 | 0.088 | 0.331 | 0.046 | 0.171 |
| 1.940000000000005 | 0.023 | 0.087 | 0.329 | 0.045 | 0.169 |
| 1.944000000000005 | 0.023 | 0.086 | 0.326 | 0.044 | 0.168 |
| 1.948000000000005 | 0.022 | 0.085 | 0.324 | 0.044 | 0.166 |
| 1.952000000000005 | 0.022 | 0.084 | 0.321 | 0.043 | 0.165 |
| 1.956000000000005 | 0.022 | 0.083 | 0.319 | 0.043 | 0.163 |
| 1.960000000000005 | 0.021 | 0.082 | 0.317 | 0.042 | 0.162 |
| 1.964000000000005 | 0.021 | 0.081 | 0.314 | 0.041 | 0.16 |
| 1.968000000000005 | 0.021 | 0.081 | 0.312 | 0.041 | 0.159 |
| 1.972000000000005 | 0.02 | 0.08 | 0.31 | 0.04 | 0.157 |
| 1.976000000000005 | 0.02 | 0.079 | 0.307 | 0.04 | 0.155 |
| 1.980000000000005 | 0.02 | 0.078 | 0.305 | 0.039 | 0.154 |
| 1.984000000000005 | 0.02 | 0.077 | 0.302 | 0.039 | 0.152 |
| 1.988000000000005 | 0.019 | 0.076 | 0.3 | 0.038 | 0.151 |
| 1.992000000000005 | 0.019 | 0.075 | 0.298 | 0.038 | 0.149 |
| 1.996000000000005 | 0.019 | 0.074 | 0.295 | 0.037 | 0.148 |
| 2.000000000000005 | 0.018 | 0.073 | 0.293 | 0.037 | 0.147 |
| 2.004000000000005 | 0.018 | 0.072 | 0.291 | 0.036 | 0.145 |
| 2.008000000000005 | 0.018 | 0.072 | 0.288 | 0.036 | 0.144 |
| 2.012000000000005 | 0.017 | 0.071 | 0.286 | 0.035 | 0.142 |
| 2.016000000000005 | 0.017 | 0.07 | 0.284 | 0.035 | 0.141 |
| 2.020000000000005 | 0.017 | 0.069 | 0.281 | 0.034 | 0.139 |
| 2.024000000000005 | 0.017 | 0.068 | 0.279 | 0.034 | 0.138 |
| 2.028000000000005 | 0.016 | 0.067 | 0.277 | 0.033 | 0.136 |
| 2.032000000000005 | 0.016 | 0.066 | 0.274 | 0.033 | 0.135 |
| 2.036000000000005 | 0.016 | 0.066 | 0.272 | 0.032 | 0.134 |
| 2.040000000000005 | 0.016 | 0.065 | 0.27 | 0.032 | 0.132 |
| 2.044000000000005 | 0.015 | 0.064 | 0.268 | 0.031 | 0.131 |
| 2.048000000000005 | 0.015 | 0.063 | 0.265 | 0.031 | 0.13 |
| 2.052000000000005 | 0.015 | 0.062 | 0.263 | 0.03 | 0.128 |
| 2.056000000000005 | 0.015 | 0.062 | 0.261 | 0.03 | 0.127 |
| 2.060000000000005 | 0.014 | 0.061 | 0.259 | 0.03 | 0.125 |
| 2.064000000000005 | 0.014 | 0.06 | 0.256 | 0.029 | 0.124 |
| 2.068000000000005 | 0.014 | 0.059 | 0.254 | 0.029 | 0.123 |
| 2.072000000000005 | 0.014 | 0.059 | 0.252 | 0.028 | 0.122 |
| 2.076000000000005 | 0.013 | 0.058 | 0.25 | 0.028 | 0.12 |
| 2.080000000000005 | 0.013 | 0.057 | 0.247 | 0.027 | 0.119 |
| 2.084000000000005 | 0.013 | 0.056 | 0.245 | 0.027 | 0.118 |
| 2.088000000000005 | 0.013 | 0.056 | 0.243 | 0.027 | 0.116 |
| 2.092000000000005 | 0.013 | 0.055 | 0.241 | 0.026 | 0.115 |
| 2.096000000000005 | 0.012 | 0.054 | 0.239 | 0.026 | 0.114 |
| 2.100000000000005 | 0.012 | 0.054 | 0.236 | 0.026 | 0.113 |
| 2.104000000000005 | 0.012 | 0.053 | 0.234 | 0.025 | 0.111 |
| 2.108000000000005 | 0.012 | 0.052 | 0.232 | 0.025 | 0.11 |
| 2.112000000000005 | 0.012 | 0.052 | 0.23 | 0.024 | 0.109 |
| 2.116000000000005 | 0.011 | 0.051 | 0.228 | 0.024 | 0.108 |
| 2.120000000000005 | 0.011 | 0.05 | 0.226 | 0.024 | 0.106 |
| 2.124000000000005 | 0.011 | 0.05 | 0.224 | 0.023 | 0.105 |
| 2.128000000000005 | 0.011 | 0.049 | 0.221 | 0.023 | 0.104 |
| 2.132000000000005 | 0.011 | 0.048 | 0.219 | 0.023 | 0.103 |
| 2.136000000000005 | 0.01 | 0.048 | 0.217 | 0.022 | 0.102 |
| 2.140000000000005 | 0.01 | 0.047 | 0.215 | 0.022 | 0.101 |
| 2.144000000000005 | 0.01 | 0.046 | 0.213 | 0.022 | 0.099 |
| 2.148000000000005 | 0.01 | 0.046 | 0.211 | 0.021 | 0.098 |
| 2.152000000000005 | 0.01 | 0.045 | 0.209 | 0.021 | 0.097 |
| 2.156000000000005 | 0.01 | 0.045 | 0.207 | 0.021 | 0.096 |
| 2.160000000000005 | 0.009 | 0.044 | 0.205 | 0.02 | 0.095 |
| 2.164000000000005 | 0.009 | 0.043 | 0.203 | 0.02 | 0.094 |
| 2.168000000000005 | 0.009 | 0.043 | 0.201 | 0.02 | 0.093 |
| 2.172000000000005 | 0.009 | 0.042 | 0.199 | 0.019 | 0.092 |
| 2.176000000000005 | 0.009 | 0.042 | 0.197 | 0.019 | 0.09 |
| 2.180000000000005 | 0.009 | 0.041 | 0.195 | 0.019 | 0.089 |
| 2.184000000000005 | 0.008 | 0.04 | 0.193 | 0.019 | 0.088 |
| 2.188000000000005 | 0.008 | 0.04 | 0.191 | 0.018 | 0.087 |
| 2.192000000000005 | 0.008 | 0.039 | 0.189 | 0.018 | 0.086 |
| 2.196000000000005 | 0.008 | 0.039 | 0.187 | 0.018 | 0.085 |
| 2.200000000000005 | 0.008 | 0.038 | 0.185 | 0.017 | 0.084 |
| 2.204000000000005 | 0.008 | 0.038 | 0.183 | 0.017 | 0.083 |
| 2.208000000000005 | 0.008 | 0.037 | 0.181 | 0.017 | 0.082 |
| 2.212000000000005 | 0.007 | 0.037 | 0.18 | 0.017 | 0.081 |
| 2.216000000000005 | 0.007 | 0.036 | 0.178 | 0.016 | 0.08 |
| 2.220000000000005 | 0.007 | 0.036 | 0.176 | 0.016 | 0.079 |
| 2.224000000000005 | 0.007 | 0.035 | 0.174 | 0.016 | 0.078 |
| 2.228000000000005 | 0.007 | 0.035 | 0.172 | 0.016 | 0.077 |
| 2.232000000000005 | 0.007 | 0.034 | 0.17 | 0.015 | 0.076 |
| 2.236000000000005 | 0.007 | 0.034 | 0.168 | 0.015 | 0.075 |
| 2.240000000000005 | 0.007 | 0.033 | 0.167 | 0.015 | 0.074 |
| 2.244000000000005 | 0.007 | 0.033 | 0.165 | 0.015 | 0.073 |
| 2.248000000000005 | 0.006 | 0.032 | 0.163 | 0.014 | 0.073 |
| 2.252000000000005 | 0.006 | 0.032 | 0.161 | 0.014 | 0.072 |
| 2.256000000000005 | 0.006 | 0.031 | 0.16 | 0.014 | 0.071 |
| 2.260000000000005 | 0.006 | 0.031 | 0.158 | 0.014 | 0.07 |
| 2.264000000000005 | 0.006 | 0.03 | 0.156 | 0.013 | 0.069 |
| 2.268000000000005 | 0.006 | 0.03 | 0.154 | 0.013 | 0.068 |
| 2.272000000000005 | 0.006 | 0.03 | 0.153 | 0.013 | 0.067 |
| 2.276000000000005 | 0.006 | 0.029 | 0.151 | 0.013 | 0.066 |
| 2.280000000000005 | 0.006 | 0.029 | 0.149 | 0.013 | 0.065 |
| 2.284000000000005 | 0.005 | 0.028 | 0.148 | 0.012 | 0.065 |
| 2.288000000000005 | 0.005 | 0.028 | 0.146 | 0.012 | 0.064 |
| 2.292000000000005 | 0.005 | 0.027 | 0.144 | 0.012 | 0.063 |
| 2.296000000000005 | 0.005 | 0.027 | 0.143 | 0.012 | 0.062 |
| 2.300000000000005 | 0.005 | 0.027 | 0.141 | 0.012 | 0.061 |
| 2.304000000000005 | 0.005 | 0.026 | 0.139 | 0.011 | 0.061 |
| 2.308000000000005 | 0.005 | 0.026 | 0.138 | 0.011 | 0.06 |
| 2.312000000000005 | 0.005 | 0.025 | 0.136 | 0.011 | 0.059 |
| 2.316000000000005 | 0.005 | 0.025 | 0.135 | 0.011 | 0.058 |
| 2.320000000000005 | 0.005 | 0.025 | 0.133 | 0.011 | 0.057 |
| 2.324000000000005 | 0.005 | 0.024 | 0.132 | 0.01 | 0.057 |
| 2.328000000000005 | 0.004 | 0.024 | 0.13 | 0.01 | 0.056 |
| 2.332000000000005 | 0.004 | 0.024 | 0.129 | 0.01 | 0.055 |
| 2.336000000000005 | 0.004 | 0.023 | 0.127 | 0.01 | 0.054 |
| 2.340000000000005 | 0.004 | 0.023 | 0.126 | 0.01 | 0.054 |
| 2.344000000000005 | 0.004 | 0.023 | 0.124 | 0.01 | 0.053 |
| 2.348000000000005 | 0.004 | 0.022 | 0.123 | 0.009 | 0.052 |
| 2.352000000000005 | 0.004 | 0.022 | 0.121 | 0.009 | 0.052 |
| 2.356000000000005 | 0.004 | 0.022 | 0.12 | 0.009 | 0.051 |
| 2.360000000000005 | 0.004 | 0.021 | 0.118 | 0.009 | 0.05 |
| 2.364000000000005 | 0.004 | 0.021 | 0.117 | 0.009 | 0.049 |
| 2.368000000000005 | 0.004 | 0.021 | 0.115 | 0.009 | 0.049 |
| 2.372000000000005 | 0.004 | 0.02 | 0.114 | 0.009 | 0.048 |
| 2.376000000000005 | 0.004 | 0.02 | 0.113 | 0.008 | 0.047 |
| 2.380000000000005 | 0.003 | 0.02 | 0.111 | 0.008 | 0.047 |
| 2.384000000000005 | 0.003 | 0.019 | 0.11 | 0.008 | 0.046 |
| 2.388000000000005 | 0.003 | 0.019 | 0.109 | 0.008 | 0.045 |
| 2.392000000000005 | 0.003 | 0.019 | 0.107 | 0.008 | 0.045 |
| 2.396000000000005 | 0.003 | 0.018 | 0.106 | 0.008 | 0.044 |
| 2.400000000000005 | 0.003 | 0.018 | 0.105 | 0.008 | 0.044 |
| 2.404000000000005 | 0.003 | 0.018 | 0.103 | 0.007 | 0.043 |
| 2.408000000000005 | 0.003 | 0.018 | 0.102 | 0.007 | 0.042 |
| 2.412000000000005 | 0.003 | 0.017 | 0.101 | 0.007 | 0.042 |
| 2.416000000000005 | 0.003 | 0.017 | 0.099 | 0.007 | 0.041 |
| 2.420000000000005 | 0.003 | 0.017 | 0.098 | 0.007 | 0.041 |
| 2.424000000000005 | 0.003 | 0.016 | 0.097 | 0.007 | 0.04 |
| 2.428000000000005 | 0.003 | 0.016 | 0.096 | 0.007 | 0.039 |
| 2.432000000000005 | 0.003 | 0.016 | 0.094 | 0.007 | 0.039 |
| 2.436000000000005 | 0.003 | 0.016 | 0.093 | 0.006 | 0.038 |
| 2.440000000000005 | 0.003 | 0.015 | 0.092 | 0.006 | 0.038 |
| 2.444000000000005 | 0.003 | 0.015 | 0.091 | 0.006 | 0.037 |
| 2.448000000000005 | 0.002 | 0.015 | 0.09 | 0.006 | 0.037 |
| 2.452000000000005 | 0.002 | 0.015 | 0.089 | 0.006 | 0.036 |
| 2.456000000000005 | 0.002 | 0.014 | 0.087 | 0.006 | 0.036 |
| 2.460000000000005 | 0.002 | 0.014 | 0.086 | 0.006 | 0.035 |
| 2.464000000000005 | 0.002 | 0.014 | 0.085 | 0.006 | 0.035 |
| 2.468000000000005 | 0.002 | 0.014 | 0.084 | 0.006 | 0.034 |
| 2.472000000000005 | 0.002 | 0.014 | 0.083 | 0.005 | 0.034 |
| 2.476000000000005 | 0.002 | 0.013 | 0.082 | 0.005 | 0.033 |
| 2.480000000000005 | 0.002 | 0.013 | 0.081 | 0.005 | 0.033 |
| 2.484000000000005 | 0.002 | 0.013 | 0.08 | 0.005 | 0.032 |
| 2.488000000000005 | 0.002 | 0.013 | 0.079 | 0.005 | 0.032 |
| 2.492000000000005 | 0.002 | 0.012 | 0.077 | 0.005 | 0.031 |
| 2.496000000000005 | 0.002 | 0.012 | 0.076 | 0.005 | 0.031 |
| 2.500000000000005 | 0.002 | 0.012 | 0.075 | 0.005 | 0.03 |
| 2.504000000000005 | 0.002 | 0.012 | 0.074 | 0.005 | 0.03 |
| 2.508000000000005 | 0.002 | 0.012 | 0.073 | 0.005 | 0.029 |
| 2.512000000000005 | 0.002 | 0.011 | 0.072 | 0.005 | 0.029 |
| 2.516000000000005 | 0.002 | 0.011 | 0.071 | 0.004 | 0.028 |
| 2.520000000000005 | 0.002 | 0.011 | 0.07 | 0.004 | 0.028 |
| 2.524000000000005 | 0.002 | 0.011 | 0.069 | 0.004 | 0.028 |
| 2.528000000000005 | 0.002 | 0.011 | 0.068 | 0.004 | 0.027 |
| 2.532000000000005 | 0.002 | 0.011 | 0.068 | 0.004 | 0.027 |
| 2.536000000000005 | 0.002 | 0.01 | 0.067 | 0.004 | 0.026 |
| 2.540000000000005 | 0.002 | 0.01 | 0.066 | 0.004 | 0.026 |
| 2.544000000000005 | 0.002 | 0.01 | 0.065 | 0.004 | 0.025 |
| 2.548000000000005 | 0.002 | 0.01 | 0.064 | 0.004 | 0.025 |
| 2.552000000000005 | 0.001 | 0.01 | 0.063 | 0.004 | 0.025 |
| 2.556000000000005 | 0.001 | 0.01 | 0.062 | 0.004 | 0.024 |
| 2.560000000000005 | 0.001 | 0.009 | 0.061 | 0.004 | 0.024 |
| 2.564000000000005 | 0.001 | 0.009 | 0.06 | 0.004 | 0.024 |
| 2.568000000000005 | 0.001 | 0.009 | 0.059 | 0.004 | 0.023 |
| 2.572000000000005 | 0.001 | 0.009 | 0.059 | 0.003 | 0.023 |
| 2.576000000000005 | 0.001 | 0.009 | 0.058 | 0.003 | 0.022 |
| 2.580000000000005 | 0.001 | 0.009 | 0.057 | 0.003 | 0.022 |
| 2.584000000000005 | 0.001 | 0.008 | 0.056 | 0.003 | 0.022 |
| 2.588000000000005 | 0.001 | 0.008 | 0.055 | 0.003 | 0.021 |
| 2.592000000000005 | 0.001 | 0.008 | 0.055 | 0.003 | 0.021 |
| 2.596000000000005 | 0.001 | 0.008 | 0.054 | 0.003 | 0.021 |
| 2.600000000000005 | 0.001 | 0.008 | 0.053 | 0.003 | 0.02 |
| 2.604000000000005 | 0.001 | 0.008 | 0.052 | 0.003 | 0.02 |
| 2.608000000000005 | 0.001 | 0.008 | 0.051 | 0.003 | 0.02 |
| 2.612000000000005 | 0.001 | 0.007 | 0.051 | 0.003 | 0.019 |
| 2.616000000000005 | 0.001 | 0.007 | 0.05 | 0.003 | 0.019 |
| 2.620000000000005 | 0.001 | 0.007 | 0.049 | 0.003 | 0.019 |
| 2.624000000000005 | 0.001 | 0.007 | 0.048 | 0.003 | 0.018 |
| 2.628000000000005 | 0.001 | 0.007 | 0.048 | 0.003 | 0.018 |
| 2.632000000000005 | 0.001 | 0.007 | 0.047 | 0.003 | 0.018 |
| 2.636000000000005 | 0.001 | 0.007 | 0.046 | 0.003 | 0.018 |
| 2.640000000000005 | 0.001 | 0.007 | 0.046 | 0.002 | 0.017 |
| 2.644000000000005 | 0.001 | 0.006 | 0.045 | 0.002 | 0.017 |
| 2.648000000000005 | 0.001 | 0.006 | 0.044 | 0.002 | 0.017 |
| 2.652000000000005 | 0.001 | 0.006 | 0.044 | 0.002 | 0.016 |
| 2.656000000000005 | 0.001 | 0.006 | 0.043 | 0.002 | 0.016 |
| 2.660000000000005 | 0.001 | 0.006 | 0.042 | 0.002 | 0.016 |
| 2.664000000000005 | 0.001 | 0.006 | 0.042 | 0.002 | 0.016 |
| 2.668000000000005 | 0.001 | 0.006 | 0.041 | 0.002 | 0.015 |
| 2.672000000000005 | 0.001 | 0.006 | 0.04 | 0.002 | 0.015 |
| 2.676000000000005 | 0.001 | 0.006 | 0.04 | 0.002 | 0.015 |
| 2.680000000000005 | 0.001 | 0.005 | 0.039 | 0.002 | 0.015 |
| 2.684000000000005 | 0.001 | 0.005 | 0.039 | 0.002 | 0.014 |
| 2.688000000000005 | 0.001 | 0.005 | 0.038 | 0.002 | 0.014 |
| 2.692000000000005 | 0.001 | 0.005 | 0.037 | 0.002 | 0.014 |
| 2.696000000000005 | 0.001 | 0.005 | 0.037 | 0.002 | 0.014 |
| 2.700000000000005 | 0.001 | 0.005 | 0.036 | 0.002 | 0.013 |
| 2.704000000000005 | 0.001 | 0.005 | 0.036 | 0.002 | 0.013 |
| 2.708000000000005 | 0.001 | 0.005 | 0.035 | 0.002 | 0.013 |
| 2.712000000000005 | 0.001 | 0.005 | 0.035 | 0.002 | 0.013 |
| 2.716000000000005 | 0.001 | 0.005 | 0.034 | 0.002 | 0.013 |
| 2.720000000000005 | 0.001 | 0.005 | 0.034 | 0.002 | 0.012 |
| 2.724000000000005 | 0.001 | 0.004 | 0.033 | 0.002 | 0.012 |
| 2.728000000000005 | 0.001 | 0.004 | 0.032 | 0.002 | 0.012 |
| 2.732000000000005 | 0.001 | 0.004 | 0.032 | 0.002 | 0.012 |
| 2.736000000000005 | 0.001 | 0.004 | 0.031 | 0.002 | 0.011 |
| 2.740000000000005 | 0.001 | 0.004 | 0.031 | 0.002 | 0.011 |
| 2.744000000000005 | 0.001 | 0.004 | 0.03 | 0.001 | 0.011 |
| 2.748000000000005 | 0.001 | 0.004 | 0.03 | 0.001 | 0.011 |
| 2.752000000000005 | 0.001 | 0.004 | 0.029 | 0.001 | 0.011 |
| 2.756000000000005 | 0.001 | 0.004 | 0.029 | 0.001 | 0.011 |
| 2.760000000000005 | 0 | 0.004 | 0.029 | 0.001 | 0.01 |
| 2.764000000000005 | 0 | 0.004 | 0.028 | 0.001 | 0.01 |
| 2.768000000000005 | 0 | 0.004 | 0.028 | 0.001 | 0.01 |
| 2.772000000000005 | 0 | 0.004 | 0.027 | 0.001 | 0.01 |
| 2.776000000000005 | 0 | 0.003 | 0.027 | 0.001 | 0.01 |
| 2.780000000000005 | 0 | 0.003 | 0.026 | 0.001 | 0.009 |
| 2.784000000000005 | 0 | 0.003 | 0.026 | 0.001 | 0.009 |
| 2.788000000000006 | 0 | 0.003 | 0.025 | 0.001 | 0.009 |
| 2.792000000000005 | 0 | 0.003 | 0.025 | 0.001 | 0.009 |
| 2.796000000000005 | 0 | 0.003 | 0.025 | 0.001 | 0.009 |
| 2.800000000000006 | 0 | 0.003 | 0.024 | 0.001 | 0.009 |
| 2.804000000000006 | 0 | 0.003 | 0.024 | 0.001 | 0.008 |
| 2.808000000000006 | 0 | 0.003 | 0.023 | 0.001 | 0.008 |
| 2.812000000000006 | 0 | 0.003 | 0.023 | 0.001 | 0.008 |
| 2.816000000000006 | 0 | 0.003 | 0.023 | 0.001 | 0.008 |
| 2.820000000000006 | 0 | 0.003 | 0.022 | 0.001 | 0.008 |
| 2.824000000000006 | 0 | 0.003 | 0.022 | 0.001 | 0.008 |
| 2.828000000000006 | 0 | 0.003 | 0.022 | 0.001 | 0.008 |
| 2.832000000000006 | 0 | 0.003 | 0.021 | 0.001 | 0.007 |
| 2.836000000000006 | 0 | 0.003 | 0.021 | 0.001 | 0.007 |
| 2.840000000000006 | 0 | 0.003 | 0.02 | 0.001 | 0.007 |
| 2.844000000000006 | 0 | 0.002 | 0.02 | 0.001 | 0.007 |
| 2.848000000000006 | 0 | 0.002 | 0.02 | 0.001 | 0.007 |
| 2.852000000000006 | 0 | 0.002 | 0.019 | 0.001 | 0.007 |
| 2.856000000000006 | 0 | 0.002 | 0.019 | 0.001 | 0.007 |
| 2.860000000000006 | 0 | 0.002 | 0.019 | 0.001 | 0.007 |
| 2.864000000000006 | 0 | 0.002 | 0.018 | 0.001 | 0.006 |
| 2.868000000000006 | 0 | 0.002 | 0.018 | 0.001 | 0.006 |
| 2.872000000000006 | 0 | 0.002 | 0.018 | 0.001 | 0.006 |
| 2.876000000000006 | 0 | 0.002 | 0.017 | 0.001 | 0.006 |
| 2.880000000000006 | 0 | 0.002 | 0.017 | 0.001 | 0.006 |
| 2.884000000000006 | 0 | 0.002 | 0.017 | 0.001 | 0.006 |
| 2.888000000000006 | 0 | 0.002 | 0.017 | 0.001 | 0.006 |
| 2.892000000000006 | 0 | 0.002 | 0.016 | 0.001 | 0.006 |
| 2.896000000000006 | 0 | 0.002 | 0.016 | 0.001 | 0.006 |
| 2.900000000000006 | 0 | 0.002 | 0.016 | 0.001 | 0.005 |
| 2.904000000000006 | 0 | 0.002 | 0.015 | 0.001 | 0.005 |
| 2.908000000000006 | 0 | 0.002 | 0.015 | 0.001 | 0.005 |
| 2.912000000000006 | 0 | 0.002 | 0.015 | 0.001 | 0.005 |
| 2.916000000000006 | 0 | 0.002 | 0.015 | 0.001 | 0.005 |
| 2.920000000000006 | 0 | 0.002 | 0.014 | 0.001 | 0.005 |
| 2.924000000000006 | 0 | 0.002 | 0.014 | 0.001 | 0.005 |
| 2.928000000000006 | 0 | 0.002 | 0.014 | 0.001 | 0.005 |
| 2.932000000000006 | 0 | 0.002 | 0.014 | 0.001 | 0.005 |
| 2.936000000000006 | 0 | 0.002 | 0.013 | 0.001 | 0.005 |
| 2.940000000000006 | 0 | 0.002 | 0.013 | 0.001 | 0.004 |
| 2.944000000000006 | 0 | 0.001 | 0.013 | 0.001 | 0.004 |
| 2.948000000000006 | 0 | 0.001 | 0.013 | 0 | 0.004 |
| 2.952000000000006 | 0 | 0.001 | 0.012 | 0 | 0.004 |
| 2.956000000000006 | 0 | 0.001 | 0.012 | 0 | 0.004 |
| 2.960000000000006 | 0 | 0.001 | 0.012 | 0 | 0.004 |
| 2.964000000000006 | 0 | 0.001 | 0.012 | 0 | 0.004 |
| 2.968000000000006 | 0 | 0.001 | 0.012 | 0 | 0.004 |
| 2.972000000000006 | 0 | 0.001 | 0.011 | 0 | 0.004 |
| 2.976000000000006 | 0 | 0.001 | 0.011 | 0 | 0.004 |
| 2.980000000000006 | 0 | 0.001 | 0.011 | 0 | 0.004 |
| 2.984000000000006 | 0 | 0.001 | 0.011 | 0 | 0.004 |
| 2.988000000000006 | 0 | 0.001 | 0.011 | 0 | 0.004 |
| 2.992000000000006 | 0 | 0.001 | 0.01 | 0 | 0.003 |
| 2.996000000000006 | 0 | 0.001 | 0.01 | 0 | 0.003 |
| 3.000000000000006 | 0 | 0.001 | 0.01 | 0 | 0.003 |
| 3.004000000000006 | 0 | 0.001 | 0.01 | 0 | 0.003 |
| 3.008000000000006 | 0 | 0.001 | 0.01 | 0 | 0.003 |
| 3.012000000000006 | 0 | 0.001 | 0.009 | 0 | 0.003 |
| 3.016000000000006 | 0 | 0.001 | 0.009 | 0 | 0.003 |
| 3.020000000000006 | 0 | 0.001 | 0.009 | 0 | 0.003 |
| 3.024000000000006 | 0 | 0.001 | 0.009 | 0 | 0.003 |
| 3.028000000000006 | 0 | 0.001 | 0.009 | 0 | 0.003 |
| 3.032000000000006 | 0 | 0.001 | 0.009 | 0 | 0.003 |
| 3.036000000000006 | 0 | 0.001 | 0.008 | 0 | 0.003 |
| 3.040000000000006 | 0 | 0.001 | 0.008 | 0 | 0.003 |
| 3.044000000000006 | 0 | 0.001 | 0.008 | 0 | 0.003 |
| 3.048000000000006 | 0 | 0.001 | 0.008 | 0 | 0.003 |
| 3.052000000000006 | 0 | 0.001 | 0.008 | 0 | 0.003 |
| 3.056000000000006 | 0 | 0.001 | 0.008 | 0 | 0.003 |
| 3.060000000000006 | 0 | 0.001 | 0.008 | 0 | 0.002 |
| 3.064000000000006 | 0 | 0.001 | 0.007 | 0 | 0.002 |
| 3.068000000000006 | 0 | 0.001 | 0.007 | 0 | 0.002 |
| 3.072000000000006 | 0 | 0.001 | 0.007 | 0 | 0.002 |
| 3.076000000000006 | 0 | 0.001 | 0.007 | 0 | 0.002 |
| 3.080000000000006 | 0 | 0.001 | 0.007 | 0 | 0.002 |
| 3.084000000000006 | 0 | 0.001 | 0.007 | 0 | 0.002 |
| 3.088000000000006 | 0 | 0.001 | 0.007 | 0 | 0.002 |
| 3.092000000000006 | 0 | 0.001 | 0.006 | 0 | 0.002 |
| 3.096000000000006 | 0 | 0.001 | 0.006 | 0 | 0.002 |
| 3.100000000000006 | 0 | 0.001 | 0.006 | 0 | 0.002 |
| 3.104000000000006 | 0 | 0.001 | 0.006 | 0 | 0.002 |
| 3.108000000000006 | 0 | 0.001 | 0.006 | 0 | 0.002 |
| 3.112000000000006 | 0 | 0.001 | 0.006 | 0 | 0.002 |
| 3.116000000000006 | 0 | 0.001 | 0.006 | 0 | 0.002 |
| 3.120000000000006 | 0 | 0.001 | 0.006 | 0 | 0.002 |
| 3.124000000000006 | 0 | 0.001 | 0.006 | 0 | 0.002 |
| 3.128000000000006 | 0 | 0.001 | 0.005 | 0 | 0.002 |
| 3.132000000000006 | 0 | 0.001 | 0.005 | 0 | 0.002 |
| 3.136000000000006 | 0 | 0.001 | 0.005 | 0 | 0.002 |
| 3.140000000000006 | 0 | 0.001 | 0.005 | 0 | 0.002 |
| 3.144000000000006 | 0 | 0.001 | 0.005 | 0 | 0.002 |
| 3.148000000000006 | 0 | 0 | 0.005 | 0 | 0.002 |
| 3.152000000000006 | 0 | 0 | 0.005 | 0 | 0.002 |
| 3.156000000000006 | 0 | 0 | 0.005 | 0 | 0.001 |
| 3.160000000000006 | 0 | 0 | 0.005 | 0 | 0.001 |
| 3.164000000000006 | 0 | 0 | 0.005 | 0 | 0.001 |
| 3.168000000000006 | 0 | 0 | 0.004 | 0 | 0.001 |
| 3.172000000000006 | 0 | 0 | 0.004 | 0 | 0.001 |
| 3.176000000000006 | 0 | 0 | 0.004 | 0 | 0.001 |
| 3.180000000000006 | 0 | 0 | 0.004 | 0 | 0.001 |
| 3.184000000000006 | 0 | 0 | 0.004 | 0 | 0.001 |
| 3.188000000000006 | 0 | 0 | 0.004 | 0 | 0.001 |
| 3.192000000000006 | 0 | 0 | 0.004 | 0 | 0.001 |
| 3.196000000000006 | 0 | 0 | 0.004 | 0 | 0.001 |
| 3.200000000000006 | 0 | 0 | 0.004 | 0 | 0.001 |
| 3.204000000000006 | 0 | 0 | 0.004 | 0 | 0.001 |
| 3.208000000000006 | 0 | 0 | 0.004 | 0 | 0.001 |
| 3.212000000000006 | 0 | 0 | 0.004 | 0 | 0.001 |
| 3.216000000000006 | 0 | 0 | 0.003 | 0 | 0.001 |
| 3.220000000000006 | 0 | 0 | 0.003 | 0 | 0.001 |
| 3.224000000000006 | 0 | 0 | 0.003 | 0 | 0.001 |
| 3.228000000000006 | 0 | 0 | 0.003 | 0 | 0.001 |
| 3.232000000000006 | 0 | 0 | 0.003 | 0 | 0.001 |
| 3.236000000000006 | 0 | 0 | 0.003 | 0 | 0.001 |
| 3.240000000000006 | 0 | 0 | 0.003 | 0 | 0.001 |
| 3.244000000000006 | 0 | 0 | 0.003 | 0 | 0.001 |
| 3.248000000000006 | 0 | 0 | 0.003 | 0 | 0.001 |
| 3.252000000000006 | 0 | 0 | 0.003 | 0 | 0.001 |
| 3.256000000000006 | 0 | 0 | 0.003 | 0 | 0.001 |
| 3.260000000000006 | 0 | 0 | 0.003 | 0 | 0.001 |
| 3.264000000000006 | 0 | 0 | 0.003 | 0 | 0.001 |
| 3.268000000000006 | 0 | 0 | 0.003 | 0 | 0.001 |
| 3.272000000000006 | 0 | 0 | 0.003 | 0 | 0.001 |
| 3.276000000000006 | 0 | 0 | 0.003 | 0 | 0.001 |
| 3.280000000000006 | 0 | 0 | 0.002 | 0 | 0.001 |
| 3.284000000000006 | 0 | 0 | 0.002 | 0 | 0.001 |
| 3.288000000000006 | 0 | 0 | 0.002 | 0 | 0.001 |
| 3.292000000000006 | 0 | 0 | 0.002 | 0 | 0.001 |
| 3.296000000000006 | 0 | 0 | 0.002 | 0 | 0.001 |
| 3.300000000000006 | 0 | 0 | 0.002 | 0 | 0.001 |
| 3.304000000000006 | 0 | 0 | 0.002 | 0 | 0.001 |
| 3.308000000000006 | 0 | 0 | 0.002 | 0 | 0.001 |
| 3.312000000000006 | 0 | 0 | 0.002 | 0 | 0.001 |
| 3.316000000000006 | 0 | 0 | 0.002 | 0 | 0.001 |
| 3.320000000000006 | 0 | 0 | 0.002 | 0 | 0.001 |
| 3.324000000000006 | 0 | 0 | 0.002 | 0 | 0.001 |
| 3.328000000000006 | 0 | 0 | 0.002 | 0 | 0.001 |
| 3.332000000000006 | 0 | 0 | 0.002 | 0 | 0.001 |
| 3.336000000000006 | 0 | 0 | 0.002 | 0 | 0.001 |
| 3.340000000000006 | 0 | 0 | 0.002 | 0 | 0.001 |
| 3.344000000000006 | 0 | 0 | 0.002 | 0 | 0.001 |
| 3.348000000000006 | 0 | 0 | 0.002 | 0 | 0.001 |
| 3.352000000000006 | 0 | 0 | 0.002 | 0 | 0 |
| 3.356000000000006 | 0 | 0 | 0.002 | 0 | 0 |
| 3.360000000000006 | 0 | 0 | 0.002 | 0 | 0 |
| 3.364000000000006 | 0 | 0 | 0.002 | 0 | 0 |
| 3.368000000000006 | 0 | 0 | 0.002 | 0 | 0 |
| 3.372000000000006 | 0 | 0 | 0.001 | 0 | 0 |
| 3.376000000000006 | 0 | 0 | 0.001 | 0 | 0 |
| 3.380000000000006 | 0 | 0 | 0.001 | 0 | 0 |
| 3.384000000000006 | 0 | 0 | 0.001 | 0 | 0 |
| 3.388000000000006 | 0 | 0 | 0.001 | 0 | 0 |
| 3.392000000000006 | 0 | 0 | 0.001 | 0 | 0 |
| 3.396000000000006 | 0 | 0 | 0.001 | 0 | 0 |
| 3.400000000000006 | 0 | 0 | 0.001 | 0 | 0 |
| 3.404000000000006 | 0 | 0 | 0.001 | 0 | 0 |
| 3.408000000000006 | 0 | 0 | 0.001 | 0 | 0 |
| 3.412000000000006 | 0 | 0 | 0.001 | 0 | 0 |
| 3.416000000000006 | 0 | 0 | 0.001 | 0 | 0 |
| 3.420000000000006 | 0 | 0 | 0.001 | 0 | 0 |
| 3.424000000000006 | 0 | 0 | 0.001 | 0 | 0 |
| 3.428000000000006 | 0 | 0 | 0.001 | 0 | 0 |
| 3.432000000000006 | 0 | 0 | 0.001 | 0 | 0 |
| 3.436000000000006 | 0 | 0 | 0.001 | 0 | 0 |
| 3.440000000000006 | 0 | 0 | 0.001 | 0 | 0 |
| 3.444000000000006 | 0 | 0 | 0.001 | 0 | 0 |
| 3.448000000000006 | 0 | 0 | 0.001 | 0 | 0 |
| 3.452000000000006 | 0 | 0 | 0.001 | 0 | 0 |
| 3.456000000000006 | 0 | 0 | 0.001 | 0 | 0 |
| 3.460000000000006 | 0 | 0 | 0.001 | 0 | 0 |
| 3.464000000000006 | 0 | 0 | 0.001 | 0 | 0 |
| 3.468000000000006 | 0 | 0 | 0.001 | 0 | 0 |
| 3.472000000000006 | 0 | 0 | 0.001 | 0 | 0 |
| 3.476000000000006 | 0 | 0 | 0.001 | 0 | 0 |
| 3.480000000000006 | 0 | 0 | 0.001 | 0 | 0 |
| 3.484000000000006 | 0 | 0 | 0.001 | 0 | 0 |
| 3.488000000000006 | 0 | 0 | 0.001 | 0 | 0 |
| 3.492000000000006 | 0 | 0 | 0.001 | 0 | 0 |
| 3.496000000000006 | 0 | 0 | 0.001 | 0 | 0 |
| 3.500000000000006 | 0 | 0 | 0.001 | 0 | 0 |
| 3.504000000000006 | 0 | 0 | 0.001 | 0 | 0 |
| 3.508000000000006 | 0 | 0 | 0.001 | 0 | 0 |
| 3.512000000000006 | 0 | 0 | 0.001 | 0 | 0 |
| 3.516000000000006 | 0 | 0 | 0.001 | 0 | 0 |
| 3.520000000000006 | 0 | 0 | 0.001 | 0 | 0 |
| 3.524000000000006 | 0 | 0 | 0.001 | 0 | 0 |
| 3.528000000000006 | 0 | 0 | 0.001 | 0 | 0 |
| 3.532000000000006 | 0 | 0 | 0.001 | 0 | 0 |
| 3.536000000000006 | 0 | 0 | 0.001 | 0 | 0 |
| 3.540000000000006 | 0 | 0 | 0.001 | 0 | 0 |
| 3.544000000000006 | 0 | 0 | 0.001 | 0 | 0 |
| 3.548000000000006 | 0 | 0 | 0.001 | 0 | 0 |
| 3.552000000000006 | 0 | 0 | 0.001 | 0 | 0 |
| 3.556000000000006 | 0 | 0 | 0.001 | 0 | 0 |
| 3.560000000000006 | 0 | 0 | 0.001 | 0 | 0 |
| 3.564000000000006 | 0 | 0 | 0 | 0 | 0 |
| 3.568000000000006 | 0 | 0 | 0 | 0 | 0 |
| 3.572000000000006 | 0 | 0 | 0 | 0 | 0 |
| 3.576000000000006 | 0 | 0 | 0 | 0 | 0 |
| 3.580000000000006 | 0 | 0 | 0 | 0 | 0 |
| 3.584000000000006 | 0 | 0 | 0 | 0 | 0 |
| 3.588000000000006 | 0 | 0 | 0 | 0 | 0 |
| 3.592000000000006 | 0 | 0 | 0 | 0 | 0 |
| 3.596000000000006 | 0 | 0 | 0 | 0 | 0 |
| 3.600000000000006 | 0 | 0 | 0 | 0 | 0 |
| 3.604000000000006 | 0 | 0 | 0 | 0 | 0 |
| 3.608000000000006 | 0 | 0 | 0 | 0 | 0 |
| 3.612000000000006 | 0 | 0 | 0 | 0 | 0 |
| 3.616000000000006 | 0 | 0 | 0 | 0 | 0 |
| 3.620000000000006 | 0 | 0 | 0 | 0 | 0 |
| 3.624000000000006 | 0 | 0 | 0 | 0 | 0 |
| 3.628000000000006 | 0 | 0 | 0 | 0 | 0 |
| 3.632000000000006 | 0 | 0 | 0 | 0 | 0 |
| 3.636000000000006 | 0 | 0 | 0 | 0 | 0 |
| 3.640000000000006 | 0 | 0 | 0 | 0 | 0 |
| 3.644000000000006 | 0 | 0 | 0 | 0 | 0 |
| 3.648000000000006 | 0 | 0 | 0 | 0 | 0 |
| 3.652000000000006 | 0 | 0 | 0 | 0 | 0 |
| 3.656000000000006 | 0 | 0 | 0 | 0 | 0 |
| 3.660000000000006 | 0 | 0 | 0 | 0 | 0 |
| 3.664000000000006 | 0 | 0 | 0 | 0 | 0 |
| 3.668000000000006 | 0 | 0 | 0 | 0 | 0 |
| 3.672000000000006 | 0 | 0 | 0 | 0 | 0 |
| 3.676000000000006 | 0 | 0 | 0 | 0 | 0 |
| 3.680000000000006 | 0 | 0 | 0 | 0 | 0 |
| 3.684000000000006 | 0 | 0 | 0 | 0 | 0 |
| 3.688000000000006 | 0 | 0 | 0 | 0 | 0 |
| 3.692000000000006 | 0 | 0 | 0 | 0 | 0 |
| 3.696000000000006 | 0 | 0 | 0 | 0 | 0 |
| 3.700000000000006 | 0 | 0 | 0 | 0 | 0 |
| 3.704000000000006 | 0 | 0 | 0 | 0 | 0 |
| 3.708000000000006 | 0 | 0 | 0 | 0 | 0 |
| 3.712000000000006 | 0 | 0 | 0 | 0 | 0 |
| 3.716000000000006 | 0 | 0 | 0 | 0 | 0 |
| 3.720000000000006 | 0 | 0 | 0 | 0 | 0 |
| 3.724000000000006 | 0 | 0 | 0 | 0 | 0 |
| 3.728000000000006 | 0 | 0 | 0 | 0 | 0 |
| 3.732000000000006 | 0 | 0 | 0 | 0 | 0 |
| 3.736000000000006 | 0 | 0 | 0 | 0 | 0 |
| 3.740000000000006 | 0 | 0 | 0 | 0 | 0 |
| 3.744000000000006 | 0 | 0 | 0 | 0 | 0 |
| 3.748000000000006 | 0 | 0 | 0 | 0 | 0 |
| 3.752000000000006 | 0 | 0 | 0 | 0 | 0 |
| 3.756000000000006 | 0 | 0 | 0 | 0 | 0 |
| 3.760000000000006 | 0 | 0 | 0 | 0 | 0 |
| 3.764000000000006 | 0 | 0 | 0 | 0 | 0 |
| 3.768000000000006 | 0 | 0 | 0 | 0 | 0 |
| 3.772000000000006 | 0 | 0 | 0 | 0 | 0 |
| 3.776000000000006 | 0 | 0 | 0 | 0 | 0 |
| 3.780000000000006 | 0 | 0 | 0 | 0 | 0 |
| 3.784000000000006 | 0 | 0 | 0 | 0 | 0 |
| 3.788000000000006 | 0 | 0 | 0 | 0 | 0 |
| 3.792000000000006 | 0 | 0 | 0 | 0 | 0 |
| 3.796000000000006 | 0 | 0 | 0 | 0 | 0 |
| 3.800000000000006 | 0 | 0 | 0 | 0 | 0 |
| 3.804000000000006 | 0 | 0 | 0 | 0 | 0 |
| 3.808000000000006 | 0 | 0 | 0 | 0 | 0 |
| 3.812000000000006 | 0 | 0 | 0 | 0 | 0 |
| 3.816000000000006 | 0 | 0 | 0 | 0 | 0 |
| 3.820000000000006 | 0 | 0 | 0 | 0 | 0 |
| 3.824000000000006 | 0 | 0 | 0 | 0 | 0 |
| 3.828000000000006 | 0 | 0 | 0 | 0 | 0 |
| 3.832000000000006 | 0 | 0 | 0 | 0 | 0 |
| 3.836000000000006 | 0 | 0 | 0 | 0 | 0 |
| 3.840000000000006 | 0 | 0 | 0 | 0 | 0 |
| 3.844000000000006 | 0 | 0 | 0 | 0 | 0 |
| 3.848000000000006 | 0 | 0 | 0 | 0 | 0 |
| 3.852000000000006 | 0 | 0 | 0 | 0 | 0 |
| 3.856000000000006 | 0 | 0 | 0 | 0 | 0 |
| 3.860000000000006 | 0 | 0 | 0 | 0 | 0 |
| 3.864000000000006 | 0 | 0 | 0 | 0 | 0 |
| 3.868000000000006 | 0 | 0 | 0 | 0 | 0 |
| 3.872000000000006 | 0 | 0 | 0 | 0 | 0 |
| 3.876000000000006 | 0 | 0 | 0 | 0 | 0 |
| 3.880000000000006 | 0 | 0 | 0 | 0 | 0 |
| 3.884000000000006 | 0 | 0 | 0 | 0 | 0 |
| 3.888000000000007 | 0 | 0 | 0 | 0 | 0 |
| 3.892000000000006 | 0 | 0 | 0 | 0 | 0 |
| 3.896000000000006 | 0 | 0 | 0 | 0 | 0 |
| 3.900000000000007 | 0 | 0 | 0 | 0 | 0 |
| 3.904000000000007 | 0 | 0 | 0 | 0 | 0 |
| 3.908000000000007 | 0 | 0 | 0 | 0 | 0 |
| 3.912000000000007 | 0 | 0 | 0 | 0 | 0 |
| 3.916000000000007 | 0 | 0 | 0 | 0 | 0 |
| 3.920000000000007 | 0 | 0 | 0 | 0 | 0 |
| 3.924000000000007 | 0 | 0 | 0 | 0 | 0 |
| 3.928000000000007 | 0 | 0 | 0 | 0 | 0 |
| 3.932000000000007 | 0 | 0 | 0 | 0 | 0 |
| 3.936000000000007 | 0 | 0 | 0 | 0 | 0 |
| 3.940000000000007 | 0 | 0 | 0 | 0 | 0 |
| 3.944000000000007 | 0 | 0 | 0 | 0 | 0 |
| 3.948000000000007 | 0 | 0 | 0 | 0 | 0 |
| 3.952000000000007 | 0 | 0 | 0 | 0 | 0 |
| 3.956000000000007 | 0 | 0 | 0 | 0 | 0 |
| 3.960000000000007 | 0 | 0 | 0 | 0 | 0 |
| 3.964000000000007 | 0 | 0 | 0 | 0 | 0 |
| 3.968000000000007 | 0 | 0 | 0 | 0 | 0 |
| 3.972000000000007 | 0 | 0 | 0 | 0 | 0 |
| 3.976000000000007 | 0 | 0 | 0 | 0 | 0 |
| 3.980000000000007 | 0 | 0 | 0 | 0 | 0 |
| 3.984000000000007 | 0 | 0 | 0 | 0 | 0 |
| 3.988000000000007 | 0 | 0 | 0 | 0 | 0 |
| 3.992000000000007 | 0 | 0 | 0 | 0 | 0 |
| 3.996000000000007 | 0 | 0 | 0 | 0 | 0 |
| 4.000000000000006 | 0 | 0 | 0 | 0 | 0 |